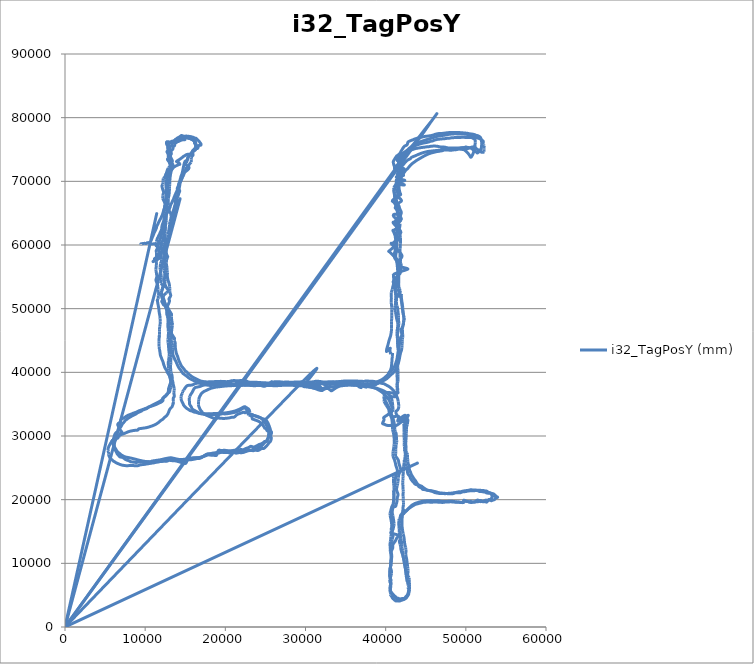
| Category | i32_TagPosY (mm) |
|---|---|
| 9508.0 | 60164 |
| 9508.0 | 60171 |
| 9514.0 | 60174 |
| 9505.0 | 60179 |
| 9490.0 | 60178 |
| 9482.0 | 60169 |
| 9490.0 | 60168 |
| 9494.0 | 60176 |
| 9494.0 | 60165 |
| 9496.0 | 60163 |
| 9495.0 | 60166 |
| 9503.0 | 60173 |
| 9493.0 | 60174 |
| 9495.0 | 60170 |
| 9493.0 | 60172 |
| 9486.0 | 60163 |
| 9476.0 | 60173 |
| 9476.0 | 60158 |
| 9491.0 | 60162 |
| 9473.0 | 60161 |
| 9464.0 | 60162 |
| 9460.0 | 60159 |
| 9462.0 | 60168 |
| 9476.0 | 60179 |
| 9481.0 | 60171 |
| 9497.0 | 60168 |
| 9513.0 | 60179 |
| 9499.0 | 60169 |
| 9489.0 | 60172 |
| 9486.0 | 60177 |
| 9472.0 | 60160 |
| 9494.0 | 60182 |
| 9512.0 | 60187 |
| 9535.0 | 60209 |
| 9546.0 | 60212 |
| 9554.0 | 60208 |
| 9574.0 | 60208 |
| 9587.0 | 60195 |
| 9631.0 | 60207 |
| 9661.0 | 60218 |
| 9683.0 | 60213 |
| 9715.0 | 60209 |
| 9768.0 | 60230 |
| 9831.0 | 60250 |
| 9904.0 | 60262 |
| 9976.0 | 60259 |
| 10040.0 | 60245 |
| 10109.0 | 60245 |
| 10147.0 | 60257 |
| 10198.0 | 60257 |
| 10268.0 | 60364 |
| 10333.0 | 60336 |
| 10413.0 | 60369 |
| 10482.0 | 60373 |
| 10530.0 | 60344 |
| 10536.0 | 60266 |
| 10630.0 | 60238 |
| 10724.0 | 60182 |
| 10878.0 | 60149 |
| 11151.0 | 60198 |
| 11250.0 | 60112 |
| 11346.0 | 59991 |
| 11384.0 | 59866 |
| 11542.0 | 59883 |
| 11562.0 | 59781 |
| 11581.0 | 59643 |
| 11616.0 | 59521 |
| 11771.0 | 59505 |
| 11882.0 | 59477 |
| 11995.0 | 59470 |
| 12104.0 | 59460 |
| 12104.0 | 59460 |
| 12074.0 | 59248 |
| 12100.0 | 59119 |
| 12120.0 | 59002 |
| 12131.0 | 58928 |
| 11970.0 | 58723 |
| 12002.0 | 58673 |
| 11736.0 | 58414 |
| 11424.0 | 58106 |
| 11167.0 | 57852 |
| 11167.0 | 57852 |
| 11175.0 | 57806 |
| 11420.0 | 57921 |
| 11351.0 | 57812 |
| 11278.0 | 57708 |
| 11243.0 | 57652 |
| 11230.0 | 57626 |
| 11421.0 | 57773 |
| 11262.0 | 57660 |
| 11044.0 | 57487 |
| 11003.0 | 57389 |
| 11380.0 | 57613 |
| 11691.0 | 57843 |
| 11884.0 | 58027 |
| 11826.0 | 58053 |
| 11690.0 | 58071 |
| 11690.0 | 58071 |
| 11604.0 | 58198 |
| 11740.0 | 58494 |
| 11740.0 | 58494 |
| 11804.0 | 58809 |
| 11723.0 | 58964 |
| 11736.0 | 59181 |
| 11694.0 | 59368 |
| 11606.0 | 59539 |
| 11516.0 | 59710 |
| 11443.0 | 59888 |
| 11438.0 | 60117 |
| 11432.0 | 60352 |
| 11403.0 | 60561 |
| 11483.0 | 60825 |
| 11502.0 | 60988 |
| 11605.0 | 61227 |
| 11702.0 | 61483 |
| 11794.0 | 61704 |
| 11865.0 | 61937 |
| 11963.0 | 62198 |
| 12052.0 | 62464 |
| 12073.0 | 62791 |
| 12118.0 | 63097 |
| 12205.0 | 63415 |
| 12299.0 | 63716 |
| 12409.0 | 64034 |
| 12519.0 | 64371 |
| 12655.0 | 64837 |
| 12777.0 | 65143 |
| 12903.0 | 65414 |
| 13025.0 | 65728 |
| 13134.0 | 66028 |
| 13162.0 | 66266 |
| 13291.0 | 66563 |
| 13403.0 | 66870 |
| 13524.0 | 67190 |
| 13621.0 | 67528 |
| 13727.0 | 67833 |
| 13825.0 | 68125 |
| 13942.0 | 68426 |
| 14024.0 | 68736 |
| 14089.0 | 69033 |
| 14127.0 | 69272 |
| 14184.0 | 69567 |
| 14263.0 | 69874 |
| 14338.0 | 70164 |
| 14404.0 | 70448 |
| 14475.0 | 70724 |
| 14541.0 | 70980 |
| 14608.0 | 71253 |
| 14657.0 | 71514 |
| 14701.0 | 71782 |
| 14748.0 | 72050 |
| 14787.0 | 72307 |
| 14827.0 | 72582 |
| 14889.0 | 72865 |
| 14981.0 | 73143 |
| 15165.0 | 73272 |
| 15287.0 | 73420 |
| 15397.0 | 73857 |
| 15467.0 | 74108 |
| 15467.0 | 74108 |
| 15570.0 | 74251 |
| 15795.0 | 74382 |
| 15864.0 | 74539 |
| 16017.0 | 74879 |
| 16103.0 | 74973 |
| 16190.0 | 75093 |
| 16296.0 | 75243 |
| 16396.0 | 75421 |
| 16249.0 | 75768 |
| 16241.0 | 75910 |
| 16253.0 | 76026 |
| 16205.0 | 76211 |
| 16274.0 | 76381 |
| 16202.0 | 76409 |
| 16051.0 | 76555 |
| 16200.0 | 76440 |
| 15964.0 | 76595 |
| 15752.0 | 76683 |
| 15506.0 | 76757 |
| 15274.0 | 76808 |
| 14870.0 | 77017 |
| 14537.0 | 77088 |
| 14537.0 | 77088 |
| 14425.0 | 76907 |
| 14273.0 | 76735 |
| 14156.0 | 76520 |
| 14028.0 | 76288 |
| 13880.0 | 76094 |
| 13880.0 | 76094 |
| 13701.0 | 75914 |
| 13667.0 | 75611 |
| 13500.0 | 75419 |
| 13471.0 | 75114 |
| 13346.0 | 74918 |
| 13220.0 | 74690 |
| 13272.0 | 74352 |
| 13184.0 | 74132 |
| 13148.0 | 73907 |
| 13274.0 | 73553 |
| 13400.0 | 73200 |
| 13343.0 | 72964 |
| 13470.0 | 72583 |
| 13525.0 | 72198 |
| 13379.0 | 71931 |
| 13256.0 | 71622 |
| 13194.0 | 71306 |
| 13149.0 | 70973 |
| 13111.0 | 70618 |
| 13083.0 | 70235 |
| 13066.0 | 69882 |
| 13064.0 | 69534 |
| 13044.0 | 69190 |
| 13037.0 | 68831 |
| 13016.0 | 68485 |
| 12999.0 | 68130 |
| 12954.0 | 67718 |
| 12875.0 | 67338 |
| 12877.0 | 66920 |
| 12900.0 | 66600 |
| 12877.0 | 66246 |
| 12839.0 | 65861 |
| 12770.0 | 65519 |
| 12770.0 | 65519 |
| 12745.0 | 65134 |
| 12623.0 | 64737 |
| 12576.0 | 64387 |
| 12511.0 | 63995 |
| 12466.0 | 63589 |
| 12531.0 | 63283 |
| 12546.0 | 62946 |
| 12503.0 | 62553 |
| 12411.0 | 62161 |
| 12345.0 | 61774 |
| 12321.0 | 61446 |
| 12247.0 | 61073 |
| 12202.0 | 60745 |
| 11947.0 | 60242 |
| 12045.0 | 59985 |
| 11850.0 | 59517 |
| 11719.0 | 59082 |
| 11856.0 | 58866 |
| 11894.0 | 58607 |
| 11972.0 | 58361 |
| 12019.0 | 58077 |
| 12037.0 | 57774 |
| 12040.0 | 57475 |
| 11916.0 | 57095 |
| 11890.0 | 56785 |
| 11858.0 | 56470 |
| 11863.0 | 56167 |
| 11961.0 | 55870 |
| 11957.0 | 55553 |
| 11977.0 | 55258 |
| 12028.0 | 54943 |
| 12007.0 | 54633 |
| 11969.0 | 54319 |
| 11945.0 | 53971 |
| 12259.0 | 53646 |
| 12168.0 | 53319 |
| 12140.0 | 53069 |
| 12019.0 | 52833 |
| 12006.0 | 52492 |
| 11930.0 | 52243 |
| 12089.0 | 51962 |
| 12183.0 | 51439 |
| 12067.0 | 51146 |
| 12185.0 | 50856 |
| 12306.0 | 50576 |
| 12592.0 | 50410 |
| 12670.0 | 49812 |
| 12670.0 | 49812 |
| 12783.0 | 49265 |
| 12826.0 | 48723 |
| 12844.0 | 48245 |
| 12852.0 | 47804 |
| 12883.0 | 47203 |
| 12888.0 | 46802 |
| 12896.0 | 46399 |
| 12901.0 | 46036 |
| 12877.0 | 45701 |
| 12864.0 | 45385 |
| 12843.0 | 45083 |
| 12824.0 | 45074 |
| 12826.0 | 45123 |
| 12863.0 | 44675 |
| 12898.0 | 44330 |
| 12925.0 | 43915 |
| 12946.0 | 43534 |
| 12980.0 | 43179 |
| 13015.0 | 42854 |
| 12978.0 | 42462 |
| 12949.0 | 42096 |
| 12898.0 | 41787 |
| 12888.0 | 41458 |
| 12889.0 | 41147 |
| 12910.0 | 40853 |
| 12913.0 | 40591 |
| 12924.0 | 40295 |
| 12937.0 | 39994 |
| 13001.0 | 39676 |
| 13075.0 | 39362 |
| 13143.0 | 39016 |
| 13195.0 | 38647 |
| 13159.0 | 38305 |
| 13159.0 | 38305 |
| 13045.0 | 37949 |
| 12995.0 | 37704 |
| 12922.0 | 37435 |
| 12896.0 | 37115 |
| 12873.0 | 36778 |
| 12711.0 | 36594 |
| 12560.0 | 36369 |
| 12377.0 | 36152 |
| 12209.0 | 35955 |
| 12088.0 | 35675 |
| 11882.0 | 35489 |
| 11649.0 | 35324 |
| 11398.0 | 35174 |
| 11171.0 | 35014 |
| 10931.0 | 34867 |
| 10723.0 | 34721 |
| 10485.0 | 34572 |
| 10344.0 | 34439 |
| 10178.0 | 34296 |
| 9895.0 | 34166 |
| 9647.0 | 34038 |
| 9512.0 | 33901 |
| 9233.0 | 33751 |
| 9020.0 | 33619 |
| 8870.0 | 33476 |
| 8605.0 | 33312 |
| 8358.0 | 33151 |
| 8127.0 | 32979 |
| 7923.0 | 32823 |
| 7729.0 | 32635 |
| 7547.0 | 32469 |
| 7437.0 | 32297 |
| 7319.0 | 32118 |
| 7174.0 | 31912 |
| 7061.0 | 31677 |
| 6965.0 | 31435 |
| 6751.0 | 31197 |
| 7107.0 | 30586 |
| 6962.0 | 30468 |
| 6821.0 | 30313 |
| 6698.0 | 30124 |
| 6727.0 | 29749 |
| 6519.0 | 29649 |
| 6398.0 | 29555 |
| 6336.0 | 29438 |
| 6196.0 | 29210 |
| 6154.0 | 28947 |
| 6139.0 | 28716 |
| 6135.0 | 28442 |
| 6131.0 | 28271 |
| 6169.0 | 28066 |
| 6245.0 | 27843 |
| 6340.0 | 27628 |
| 6436.0 | 27386 |
| 6522.0 | 27162 |
| 6640.0 | 27019 |
| 6744.0 | 26845 |
| 6856.0 | 26715 |
| 7247.0 | 26621 |
| 7247.0 | 26621 |
| 7476.0 | 26359 |
| 7742.0 | 26208 |
| 7999.0 | 26090 |
| 8196.0 | 25954 |
| 8196.0 | 25954 |
| 8503.0 | 25909 |
| 8877.0 | 25836 |
| 8877.0 | 25836 |
| 9218.0 | 25911 |
| 9616.0 | 25923 |
| 9989.0 | 25932 |
| 10329.0 | 25946 |
| 10675.0 | 25972 |
| 10869.0 | 26070 |
| 11177.0 | 26124 |
| 11474.0 | 26183 |
| 11779.0 | 26239 |
| 12067.0 | 26313 |
| 12369.0 | 26410 |
| 12663.0 | 26477 |
| 12977.0 | 26555 |
| 13280.0 | 26568 |
| 13725.0 | 26447 |
| 14127.0 | 26337 |
| 14497.0 | 26305 |
| 14851.0 | 26338 |
| 15196.0 | 26362 |
| 15527.0 | 26388 |
| 15833.0 | 26444 |
| 16140.0 | 26515 |
| 16426.0 | 26572 |
| 16718.0 | 26609 |
| 17025.0 | 26639 |
| 17438.0 | 26976 |
| 17804.0 | 27203 |
| 17974.0 | 27197 |
| 18179.0 | 27201 |
| 18408.0 | 27245 |
| 18666.0 | 27270 |
| 18921.0 | 27300 |
| 19154.0 | 27321 |
| 19480.0 | 27425 |
| 19761.0 | 27420 |
| 20054.0 | 27416 |
| 20329.0 | 27395 |
| 20553.0 | 27340 |
| 20816.0 | 27397 |
| 21137.0 | 27392 |
| 21341.0 | 27303 |
| 21705.0 | 27394 |
| 21978.0 | 27368 |
| 22201.0 | 27425 |
| 22558.0 | 27593 |
| 22872.0 | 27806 |
| 23190.0 | 27744 |
| 23535.0 | 27701 |
| 23818.0 | 27925 |
| 24046.0 | 28121 |
| 24286.0 | 28272 |
| 24514.0 | 28447 |
| 24718.0 | 28700 |
| 24906.0 | 28963 |
| 25065.0 | 29135 |
| 25141.0 | 29117 |
| 25190.0 | 29212 |
| 25262.0 | 29339 |
| 25422.0 | 29766 |
| 25385.0 | 29716 |
| 25392.0 | 29854 |
| 25379.0 | 30032 |
| 25468.0 | 30540 |
| 25509.0 | 30976 |
| 25352.0 | 30856 |
| 25203.0 | 30833 |
| 25074.0 | 31168 |
| 24924.0 | 31214 |
| 24762.0 | 31559 |
| 24594.0 | 31828 |
| 24411.0 | 32044 |
| 24237.0 | 32244 |
| 24017.0 | 32379 |
| 23809.0 | 32470 |
| 23593.0 | 32581 |
| 23365.0 | 32678 |
| 23336.0 | 32923 |
| 23236.0 | 33130 |
| 23121.0 | 33287 |
| 23008.0 | 33486 |
| 22855.0 | 33586 |
| 22685.0 | 33747 |
| 22452.0 | 33651 |
| 22272.0 | 33735 |
| 21808.0 | 33532 |
| 21440.0 | 33344 |
| 21111.0 | 32979 |
| 20784.0 | 32931 |
| 20468.0 | 32840 |
| 20131.0 | 32789 |
| 19776.0 | 32753 |
| 19474.0 | 32790 |
| 19234.0 | 32809 |
| 18920.0 | 32835 |
| 18588.0 | 32785 |
| 18374.0 | 32883 |
| 18145.0 | 32995 |
| 17898.0 | 33128 |
| 17673.0 | 33254 |
| 17520.0 | 33370 |
| 17327.0 | 33494 |
| 17152.0 | 33612 |
| 17086.0 | 33818 |
| 16941.0 | 34012 |
| 16834.0 | 34236 |
| 16757.0 | 34473 |
| 16679.0 | 34713 |
| 16641.0 | 34954 |
| 16660.0 | 35197 |
| 16666.0 | 35443 |
| 16687.0 | 35698 |
| 16728.0 | 35964 |
| 16806.0 | 36206 |
| 16913.0 | 36439 |
| 16986.0 | 36630 |
| 17139.0 | 36808 |
| 17311.0 | 36970 |
| 17486.0 | 37082 |
| 17663.0 | 37183 |
| 17906.0 | 37329 |
| 18129.0 | 37456 |
| 18392.0 | 37554 |
| 18661.0 | 37637 |
| 18915.0 | 37701 |
| 19184.0 | 37724 |
| 19487.0 | 37778 |
| 19756.0 | 37814 |
| 20017.0 | 37848 |
| 20335.0 | 37877 |
| 20673.0 | 37879 |
| 20934.0 | 37946 |
| 21239.0 | 37989 |
| 21533.0 | 37962 |
| 21842.0 | 37929 |
| 22172.0 | 37992 |
| 22172.0 | 37992 |
| 22580.0 | 38031 |
| 22580.0 | 38031 |
| 23079.0 | 38006 |
| 23079.0 | 38006 |
| 23651.0 | 38012 |
| 24153.0 | 38001 |
| 24630.0 | 37991 |
| 25077.0 | 37954 |
| 25490.0 | 37928 |
| 25490.0 | 37928 |
| 25490.0 | 37928 |
| 25490.0 | 37928 |
| 26157.0 | 37905 |
| 26765.0 | 37921 |
| 27313.0 | 37975 |
| 27780.0 | 37963 |
| 28242.0 | 37959 |
| 28682.0 | 37938 |
| 29064.0 | 37874 |
| 29382.0 | 37903 |
| 29710.0 | 37907 |
| 30048.0 | 37909 |
| 30361.0 | 37907 |
| 30468.0 | 37689 |
| 30836.0 | 37762 |
| 30911.0 | 37562 |
| 31314.0 | 37700 |
| 31735.0 | 37278 |
| 32175.0 | 37247 |
| 32477.0 | 37428 |
| 32849.0 | 37432 |
| 33197.0 | 37105 |
| 33361.0 | 37182 |
| 33602.0 | 37389 |
| 33841.0 | 37583 |
| 34059.0 | 37734 |
| 34270.0 | 37840 |
| 34531.0 | 37888 |
| 34791.0 | 37937 |
| 35093.0 | 37976 |
| 35388.0 | 37998 |
| 35585.0 | 38027 |
| 35585.0 | 38027 |
| 35766.0 | 37960 |
| 35959.0 | 37982 |
| 36164.0 | 37977 |
| 36333.0 | 37976 |
| 36943.0 | 37605 |
| 36671.0 | 37715 |
| 36697.0 | 37782 |
| 36691.0 | 37839 |
| 36739.0 | 37885 |
| 36856.0 | 37919 |
| 37553.0 | 37678 |
| 37588.0 | 37752 |
| 37755.0 | 37907 |
| 37940.0 | 37916 |
| 38135.0 | 37911 |
| 38337.0 | 37932 |
| 38474.0 | 37961 |
| 38612.0 | 37995 |
| 38896.0 | 38172 |
| 39122.0 | 38340 |
| 39317.0 | 38479 |
| 39560.0 | 38649 |
| 39766.0 | 38853 |
| 39944.0 | 39045 |
| 40063.0 | 39239 |
| 40176.0 | 39415 |
| 40290.0 | 39625 |
| 40375.0 | 39855 |
| 40477.0 | 40056 |
| 40557.0 | 40228 |
| 40622.0 | 40423 |
| 40681.0 | 40654 |
| 40724.0 | 40952 |
| 40746.0 | 41245 |
| 40765.0 | 41525 |
| 40785.0 | 41815 |
| 40802.0 | 42114 |
| 40814.0 | 42414 |
| 40858.0 | 42728 |
| 40856.0 | 43036 |
| 40644.0 | 42851 |
| 40580.0 | 43059 |
| 40540.0 | 43348 |
| 40540.0 | 43348 |
| 40549.0 | 43752 |
| 40549.0 | 43752 |
| 40549.0 | 43752 |
| 40549.0 | 43752 |
| 40086.0 | 43294 |
| 40280.0 | 44297 |
| 40445.0 | 45103 |
| 40613.0 | 45743 |
| 40702.0 | 46349 |
| 40736.0 | 46919 |
| 40730.0 | 47492 |
| 40731.0 | 48019 |
| 40756.0 | 48509 |
| 40775.0 | 48980 |
| 40767.0 | 49431 |
| 40776.0 | 49853 |
| 40760.0 | 50229 |
| 40723.0 | 50619 |
| 40697.0 | 51008 |
| 40701.0 | 51364 |
| 40717.0 | 51686 |
| 40702.0 | 52001 |
| 40705.0 | 52300 |
| 40699.0 | 52583 |
| 40826.0 | 53008 |
| 40886.0 | 53423 |
| 40986.0 | 53835 |
| 41001.0 | 54243 |
| 41025.0 | 54638 |
| 40989.0 | 55021 |
| 40989.0 | 55021 |
| 41030.0 | 55411 |
| 42012.0 | 55887 |
| 42778.0 | 56221 |
| 42127.0 | 56492 |
| 41628.0 | 56761 |
| 41628.0 | 56761 |
| 41510.0 | 57273 |
| 41510.0 | 57273 |
| 41510.0 | 57273 |
| 41133.0 | 57951 |
| 41133.0 | 57951 |
| 41034.0 | 58472 |
| 41190.0 | 59061 |
| 41148.0 | 59703 |
| 41406.0 | 60213 |
| 41406.0 | 60213 |
| 41379.0 | 60788 |
| 41379.0 | 60788 |
| 41418.0 | 61367 |
| 41451.0 | 61870 |
| 41422.0 | 62339 |
| 41364.0 | 62810 |
| 41270.0 | 63260 |
| 41218.0 | 63663 |
| 41505.0 | 63722 |
| 41746.0 | 63831 |
| 41088.0 | 64351 |
| 41003.0 | 64795 |
| 41406.0 | 64842 |
| 41406.0 | 64842 |
| 41494.0 | 65378 |
| 41202.0 | 65815 |
| 41296.0 | 66273 |
| 41102.0 | 66684 |
| 41249.0 | 67078 |
| 41374.0 | 67443 |
| 41464.0 | 67796 |
| 41528.0 | 68149 |
| 41434.0 | 68472 |
| 41572.0 | 68782 |
| 41612.0 | 69074 |
| 41399.0 | 69360 |
| 41407.0 | 69677 |
| 41461.0 | 69983 |
| 41551.0 | 70268 |
| 41697.0 | 70540 |
| 41553.0 | 70802 |
| 41828.0 | 71063 |
| 41726.0 | 71311 |
| 41724.0 | 71562 |
| 41788.0 | 71808 |
| 41898.0 | 72047 |
| 41993.0 | 72292 |
| 42087.0 | 72521 |
| 42257.0 | 72730 |
| 42417.0 | 72963 |
| 42590.0 | 73182 |
| 42806.0 | 73386 |
| 43051.0 | 73534 |
| 43224.0 | 73762 |
| 43476.0 | 73906 |
| 43739.0 | 74034 |
| 43993.0 | 74184 |
| 44251.0 | 74311 |
| 44511.0 | 74440 |
| 44778.0 | 74541 |
| 45002.0 | 74607 |
| 45210.0 | 74673 |
| 45469.0 | 74723 |
| 45735.0 | 74757 |
| 46036.0 | 74806 |
| 46339.0 | 74839 |
| 46616.0 | 74876 |
| 46792.0 | 74874 |
| 47201.0 | 75221 |
| 47281.0 | 75128 |
| 47564.0 | 75045 |
| 47846.0 | 74983 |
| 48103.0 | 74906 |
| 48392.0 | 74956 |
| 48693.0 | 74949 |
| 48693.0 | 74949 |
| 49154.0 | 75071 |
| 49154.0 | 75071 |
| 49154.0 | 75071 |
| 49154.0 | 75071 |
| 49154.0 | 75071 |
| 49154.0 | 75071 |
| 49154.0 | 75071 |
| 49154.0 | 75071 |
| 49154.0 | 75071 |
| 49154.0 | 75071 |
| 49792.0 | 74973 |
| 49792.0 | 74973 |
| 49792.0 | 74973 |
| 49792.0 | 74973 |
| 49792.0 | 74973 |
| 49792.0 | 74973 |
| 49792.0 | 74973 |
| 49792.0 | 74973 |
| 49792.0 | 74973 |
| 50193.0 | 74517 |
| 50460.0 | 74092 |
| 50637.0 | 73768 |
| 50862.0 | 74226 |
| 51076.0 | 75044 |
| 51076.0 | 75044 |
| 51076.0 | 75044 |
| 51142.0 | 75598 |
| 51171.0 | 76118 |
| 51175.0 | 76482 |
| 51104.0 | 76790 |
| 50991.0 | 76984 |
| 50771.0 | 77161 |
| 50559.0 | 77264 |
| 50295.0 | 77345 |
| 50004.0 | 77388 |
| 49750.0 | 77421 |
| 49466.0 | 77448 |
| 49203.0 | 77444 |
| 48929.0 | 77447 |
| 48651.0 | 77466 |
| 48337.0 | 77434 |
| 48002.0 | 77400 |
| 47683.0 | 77337 |
| 47371.0 | 77252 |
| 47074.0 | 77205 |
| 46760.0 | 77152 |
| 46459.0 | 77079 |
| 46178.0 | 76971 |
| 45868.0 | 76857 |
| 45587.0 | 76734 |
| 45275.0 | 76606 |
| 44978.0 | 76498 |
| 44708.0 | 76373 |
| 44438.0 | 76258 |
| 44182.0 | 76108 |
| 43899.0 | 75950 |
| 43629.0 | 75783 |
| 43373.0 | 75610 |
| 43164.0 | 75394 |
| 42933.0 | 75182 |
| 42776.0 | 74989 |
| 42573.0 | 74782 |
| 42312.0 | 74552 |
| 42064.0 | 74295 |
| 41851.0 | 74060 |
| 41745.0 | 73818 |
| 41720.0 | 73525 |
| 41569.0 | 73242 |
| 41569.0 | 73242 |
| 41610.0 | 72889 |
| 41538.0 | 72543 |
| 42315.0 | 71946 |
| 42002.0 | 71689 |
| 41753.0 | 71416 |
| 41429.0 | 71119 |
| 41578.0 | 70830 |
| 41645.0 | 70481 |
| 41325.0 | 70214 |
| 41387.0 | 69915 |
| 41467.0 | 69605 |
| 41345.0 | 69313 |
| 41237.0 | 69046 |
| 41112.0 | 68768 |
| 41076.0 | 68454 |
| 41100.0 | 68125 |
| 41112.0 | 67761 |
| 41135.0 | 67382 |
| 41179.0 | 67013 |
| 41360.0 | 66520 |
| 41325.0 | 66202 |
| 41350.0 | 65887 |
| 41358.0 | 65544 |
| 41512.0 | 65133 |
| 41582.0 | 64807 |
| 41653.0 | 64459 |
| 41305.0 | 64121 |
| 41432.0 | 63782 |
| 41501.0 | 63417 |
| 41485.0 | 63053 |
| 41499.0 | 62704 |
| 41499.0 | 62704 |
| 40941.0 | 62268 |
| 40941.0 | 62268 |
| 40941.0 | 62268 |
| 40941.0 | 62268 |
| 40941.0 | 62268 |
| 40941.0 | 62268 |
| 41174.0 | 61478 |
| 41174.0 | 61478 |
| 41174.0 | 61478 |
| 41174.0 | 61478 |
| 41174.0 | 61478 |
| 41174.0 | 61478 |
| 41305.0 | 60344 |
| 41425.0 | 59370 |
| 41290.0 | 58668 |
| 41244.0 | 58052 |
| 41365.0 | 57408 |
| 41444.0 | 56831 |
| 41474.0 | 56303 |
| 41517.0 | 55833 |
| 41567.0 | 55405 |
| 41071.0 | 54482 |
| 40928.0 | 54204 |
| 41055.0 | 53960 |
| 41170.0 | 53642 |
| 41218.0 | 53284 |
| 41207.0 | 52875 |
| 41242.0 | 52527 |
| 41298.0 | 52212 |
| 41344.0 | 51882 |
| 41356.0 | 51514 |
| 41368.0 | 51145 |
| 41340.0 | 50748 |
| 41411.0 | 50457 |
| 41472.0 | 50169 |
| 41509.0 | 49854 |
| 41533.0 | 49532 |
| 41567.0 | 49231 |
| 41604.0 | 48912 |
| 41606.0 | 48580 |
| 41582.0 | 48213 |
| 41669.0 | 47730 |
| 41615.0 | 47411 |
| 41578.0 | 47051 |
| 41558.0 | 46730 |
| 41534.0 | 46418 |
| 41486.0 | 46033 |
| 41475.0 | 45726 |
| 41461.0 | 45358 |
| 41465.0 | 45016 |
| 41469.0 | 44666 |
| 41510.0 | 44302 |
| 41530.0 | 43964 |
| 41578.0 | 43645 |
| 41591.0 | 43330 |
| 41576.0 | 42970 |
| 41618.0 | 42608 |
| 41636.0 | 42322 |
| 41512.0 | 42099 |
| 41440.0 | 41889 |
| 41356.0 | 41477 |
| 41323.0 | 41073 |
| 41356.0 | 40682 |
| 41384.0 | 40320 |
| 41416.0 | 39948 |
| 41415.0 | 39614 |
| 41429.0 | 39270 |
| 41440.0 | 38919 |
| 41454.0 | 38572 |
| 41457.0 | 38237 |
| 41434.0 | 37938 |
| 41489.0 | 37540 |
| 41513.0 | 37150 |
| 41523.0 | 36773 |
| 41299.0 | 36617 |
| 40765.0 | 36772 |
| 40277.0 | 36846 |
| 39957.0 | 36784 |
| 39872.0 | 36505 |
| 39799.0 | 36235 |
| 39812.0 | 35901 |
| 39812.0 | 35901 |
| 40070.0 | 35276 |
| 40315.0 | 34696 |
| 40581.0 | 34109 |
| 40684.0 | 33517 |
| 40840.0 | 33037 |
| 40955.0 | 32609 |
| 41032.0 | 32195 |
| 41091.0 | 31776 |
| 41121.0 | 31365 |
| 41142.0 | 30961 |
| 41215.0 | 30655 |
| 41305.0 | 30396 |
| 41327.0 | 30051 |
| 41348.0 | 29714 |
| 41368.0 | 29350 |
| 41370.0 | 29021 |
| 41312.0 | 28661 |
| 41278.0 | 28285 |
| 41267.0 | 27915 |
| 41248.0 | 27565 |
| 41252.0 | 27217 |
| 41212.0 | 26863 |
| 41569.0 | 26234 |
| 41648.0 | 25720 |
| 41779.0 | 25190 |
| 41912.0 | 24684 |
| 41888.0 | 24420 |
| 41739.0 | 24223 |
| 41652.0 | 23979 |
| 41589.0 | 23710 |
| 41583.0 | 23465 |
| 41585.0 | 23272 |
| 41527.0 | 22839 |
| 41515.0 | 22523 |
| 41429.0 | 22231 |
| 41415.0 | 22005 |
| 41354.0 | 21676 |
| 41417.0 | 21279 |
| 41489.0 | 21060 |
| 41549.0 | 20782 |
| 41465.0 | 20398 |
| 41419.0 | 20030 |
| 41396.0 | 19623 |
| 41313.0 | 19271 |
| 41239.0 | 18949 |
| 40965.0 | 18831 |
| 40875.0 | 18546 |
| 40826.0 | 18236 |
| 40825.0 | 17887 |
| 40894.0 | 17478 |
| 40949.0 | 17062 |
| 41007.0 | 16642 |
| 41048.0 | 16246 |
| 41024.0 | 15892 |
| 40961.0 | 15583 |
| 40889.0 | 15279 |
| 40826.0 | 15023 |
| 40794.0 | 14779 |
| 40927.0 | 14358 |
| 40798.0 | 13757 |
| 40780.0 | 13374 |
| 40668.0 | 12932 |
| 40604.0 | 12562 |
| 40560.0 | 12190 |
| 40583.0 | 11887 |
| 40667.0 | 11653 |
| 40676.0 | 11358 |
| 40704.0 | 11098 |
| 40713.0 | 10801 |
| 40681.0 | 10505 |
| 40655.0 | 10252 |
| 40633.0 | 9997 |
| 40623.0 | 9774 |
| 40602.0 | 9534 |
| 40561.0 | 9302 |
| 40544.0 | 9087 |
| 40525.0 | 8853 |
| 40506.0 | 8614 |
| 40495.0 | 8383 |
| 40509.0 | 8157 |
| 40516.0 | 7956 |
| 40546.0 | 7774 |
| 40574.0 | 7615 |
| 40603.0 | 7464 |
| 40528.0 | 7240 |
| 40542.0 | 7087 |
| 40595.0 | 6900 |
| 40612.0 | 6703 |
| 40602.0 | 6510 |
| 40570.0 | 6304 |
| 40588.0 | 6057 |
| 40605.0 | 5854 |
| 40588.0 | 5702 |
| 40673.0 | 5505 |
| 40809.0 | 5283 |
| 40922.0 | 5132 |
| 40999.0 | 5011 |
| 41059.0 | 4921 |
| 41216.0 | 4758 |
| 41411.0 | 4549 |
| 41477.0 | 4502 |
| 41570.0 | 4507 |
| 41761.0 | 4406 |
| 41895.0 | 4425 |
| 42000.0 | 4461 |
| 42158.0 | 4491 |
| 42239.0 | 4489 |
| 42266.0 | 4469 |
| 42417.0 | 4603 |
| 42502.0 | 4737 |
| 42597.0 | 4860 |
| 42697.0 | 5008 |
| 42766.0 | 5190 |
| 42807.0 | 5392 |
| 42845.0 | 5591 |
| 42869.0 | 5801 |
| 42833.0 | 5969 |
| 42824.0 | 6175 |
| 42843.0 | 6390 |
| 42817.0 | 6585 |
| 42762.0 | 6805 |
| 42728.0 | 7075 |
| 42652.0 | 7283 |
| 42625.0 | 7555 |
| 42588.0 | 7823 |
| 42555.0 | 8086 |
| 42544.0 | 8360 |
| 42502.0 | 8623 |
| 42483.0 | 8901 |
| 42461.0 | 9171 |
| 42415.0 | 9415 |
| 42391.0 | 9684 |
| 42340.0 | 9962 |
| 42310.0 | 10277 |
| 42259.0 | 10570 |
| 42219.0 | 10852 |
| 42166.0 | 11121 |
| 42109.0 | 11401 |
| 42021.0 | 11659 |
| 41963.0 | 11888 |
| 41917.0 | 12160 |
| 41859.0 | 12432 |
| 41861.0 | 12686 |
| 41795.0 | 13012 |
| 41710.0 | 13455 |
| 41778.0 | 13662 |
| 41828.0 | 13867 |
| 41803.0 | 14136 |
| 41773.0 | 14383 |
| 41750.0 | 14561 |
| 41711.0 | 14797 |
| 41707.0 | 15089 |
| 41677.0 | 15483 |
| 41649.0 | 15864 |
| 41646.0 | 16190 |
| 41630.0 | 16506 |
| 41636.0 | 16737 |
| 41682.0 | 16949 |
| 41759.0 | 17081 |
| 41824.0 | 17273 |
| 41853.0 | 17522 |
| 41966.0 | 17702 |
| 42068.0 | 17887 |
| 42201.0 | 18064 |
| 42328.0 | 18276 |
| 42567.0 | 18254 |
| 42739.0 | 18477 |
| 42916.0 | 18715 |
| 43105.0 | 18928 |
| 43299.0 | 19153 |
| 43488.0 | 19283 |
| 43693.0 | 19422 |
| 43924.0 | 19518 |
| 44153.0 | 19609 |
| 44396.0 | 19694 |
| 44628.0 | 19756 |
| 44874.0 | 19791 |
| 45125.0 | 19826 |
| 45389.0 | 19835 |
| 45647.0 | 19856 |
| 45902.0 | 19836 |
| 46146.0 | 19823 |
| 46368.0 | 19845 |
| 46609.0 | 19847 |
| 46859.0 | 19744 |
| 47124.0 | 19704 |
| 47377.0 | 19713 |
| 47623.0 | 19710 |
| 47858.0 | 19746 |
| 48075.0 | 19747 |
| 48333.0 | 19739 |
| 48569.0 | 19704 |
| 48815.0 | 19663 |
| 49050.0 | 19616 |
| 49269.0 | 19565 |
| 49502.0 | 19536 |
| 49719.0 | 19558 |
| 49842.0 | 19754 |
| 50137.0 | 19713 |
| 50291.0 | 19690 |
| 50500.0 | 19666 |
| 50624.0 | 19739 |
| 50815.0 | 19645 |
| 51205.0 | 19650 |
| 51447.0 | 19666 |
| 51563.0 | 19703 |
| 51817.0 | 19889 |
| 51786.0 | 19693 |
| 51980.0 | 19717 |
| 52186.0 | 19655 |
| 52414.0 | 19698 |
| 52601.0 | 19619 |
| 52865.0 | 20002 |
| 52989.0 | 19945 |
| 53089.0 | 19941 |
| 53163.0 | 19892 |
| 53188.0 | 19834 |
| 53385.0 | 19939 |
| 53472.0 | 19964 |
| 53522.0 | 19979 |
| 53615.0 | 20076 |
| 53678.0 | 20167 |
| 53686.0 | 20255 |
| 53964.0 | 20366 |
| 53844.0 | 20481 |
| 53661.0 | 20579 |
| 53670.0 | 20673 |
| 53614.0 | 20747 |
| 53538.0 | 20821 |
| 53462.0 | 20906 |
| 53338.0 | 20949 |
| 53117.0 | 21008 |
| 52967.0 | 21022 |
| 52772.0 | 21015 |
| 52600.0 | 21056 |
| 52484.0 | 21125 |
| 52369.0 | 21206 |
| 52199.0 | 21218 |
| 51985.0 | 21268 |
| 51739.0 | 21278 |
| 51607.0 | 21334 |
| 51532.0 | 21418 |
| 51375.0 | 21425 |
| 51205.0 | 21424 |
| 50181.0 | 21361 |
| 50125.0 | 21324 |
| 50038.0 | 21278 |
| 49916.0 | 21262 |
| 49775.0 | 21249 |
| 49640.0 | 21230 |
| 49484.0 | 21179 |
| 49313.0 | 21084 |
| 49151.0 | 21087 |
| 48998.0 | 21095 |
| 48847.0 | 21104 |
| 48672.0 | 21066 |
| 48468.0 | 20971 |
| 48287.0 | 20911 |
| 48118.0 | 20920 |
| 47930.0 | 20915 |
| 47754.0 | 20940 |
| 47581.0 | 20953 |
| 47394.0 | 20944 |
| 47199.0 | 20959 |
| 47036.0 | 20972 |
| 46866.0 | 20985 |
| 46704.0 | 20976 |
| 46494.0 | 21025 |
| 46339.0 | 21055 |
| 46197.0 | 21091 |
| 46068.0 | 21150 |
| 45914.0 | 21254 |
| 45756.0 | 21323 |
| 45603.0 | 21386 |
| 45445.0 | 21439 |
| 45271.0 | 21466 |
| 45105.0 | 21497 |
| 44941.0 | 21551 |
| 44778.0 | 21604 |
| 44619.0 | 21619 |
| 44494.0 | 21794 |
| 44324.0 | 21913 |
| 44139.0 | 22056 |
| 44002.0 | 22283 |
| 43783.0 | 22372 |
| 43621.0 | 22512 |
| 43500.0 | 22704 |
| 43348.0 | 22889 |
| 43228.0 | 23100 |
| 43111.0 | 23316 |
| 43037.0 | 23576 |
| 42952.0 | 23784 |
| 42827.0 | 23928 |
| 42746.0 | 24156 |
| 42710.0 | 24431 |
| 42679.0 | 24692 |
| 42581.0 | 24959 |
| 42552.0 | 25175 |
| 42542.0 | 25435 |
| 42514.0 | 25663 |
| 42493.0 | 25863 |
| 42487.0 | 26118 |
| 42483.0 | 26374 |
| 42493.0 | 26607 |
| 42494.0 | 26844 |
| 42494.0 | 27087 |
| 42500.0 | 27400 |
| 42371.0 | 27587 |
| 42358.0 | 27838 |
| 42368.0 | 28124 |
| 42317.0 | 28376 |
| 42333.0 | 28691 |
| 42323.0 | 29007 |
| 42315.0 | 29274 |
| 42312.0 | 29538 |
| 42302.0 | 29796 |
| 42296.0 | 30038 |
| 42293.0 | 30289 |
| 42285.0 | 30531 |
| 42286.0 | 30739 |
| 42294.0 | 30976 |
| 42304.0 | 31233 |
| 42297.0 | 31494 |
| 42291.0 | 31735 |
| 42236.0 | 31960 |
| 42355.0 | 32323 |
| 42509.0 | 32715 |
| 41862.0 | 32110 |
| 41290.0 | 31627 |
| 40864.0 | 31647 |
| 40442.0 | 31640 |
| 40092.0 | 31693 |
| 39849.0 | 31833 |
| 39607.0 | 31979 |
| 39810.0 | 32573 |
| 39753.0 | 32891 |
| 40225.0 | 33309 |
| 40551.0 | 33625 |
| 40765.0 | 33893 |
| 40903.0 | 34158 |
| 40878.0 | 34828 |
| 40826.0 | 35380 |
| 40767.0 | 35739 |
| 40665.0 | 36042 |
| 40571.0 | 36269 |
| 40415.0 | 36478 |
| 40224.0 | 36708 |
| 40007.0 | 36907 |
| 39786.0 | 37057 |
| 39556.0 | 37190 |
| 39309.0 | 37307 |
| 39064.0 | 37424 |
| 38822.0 | 37527 |
| 38561.0 | 37564 |
| 38293.0 | 37637 |
| 38030.0 | 37699 |
| 37713.0 | 37786 |
| 37416.0 | 37847 |
| 37100.0 | 37909 |
| 36759.0 | 38009 |
| 36496.0 | 38016 |
| 36193.0 | 38044 |
| 35865.0 | 38076 |
| 35506.0 | 38119 |
| 35506.0 | 38119 |
| 35105.0 | 38140 |
| 34691.0 | 38151 |
| 34691.0 | 38151 |
| 34284.0 | 38232 |
| 34284.0 | 38232 |
| 34284.0 | 38232 |
| 33681.0 | 38204 |
| 33681.0 | 38204 |
| 33681.0 | 38204 |
| 32990.0 | 38235 |
| 32516.0 | 38132 |
| 31997.0 | 38212 |
| 31523.0 | 38252 |
| 31909.0 | 37347 |
| 31426.0 | 37437 |
| 31426.0 | 37437 |
| 31426.0 | 37437 |
| 31426.0 | 37437 |
| 30581.0 | 37646 |
| 30581.0 | 37646 |
| 29769.0 | 37760 |
| 29085.0 | 37858 |
| 0.0 | 0 |
| 0.0 | 0 |
| 0.0 | 0 |
| 0.0 | 0 |
| 0.0 | 0 |
| 0.0 | 0 |
| 0.0 | 0 |
| 0.0 | 0 |
| 0.0 | 0 |
| 0.0 | 0 |
| 0.0 | 0 |
| 0.0 | 0 |
| 0.0 | 0 |
| 0.0 | 0 |
| 0.0 | 0 |
| 0.0 | 0 |
| 0.0 | 0 |
| 0.0 | 0 |
| 0.0 | 0 |
| 0.0 | 0 |
| 0.0 | 0 |
| 0.0 | 0 |
| 0.0 | 0 |
| 0.0 | 0 |
| 0.0 | 0 |
| 0.0 | 0 |
| 0.0 | 0 |
| 0.0 | 0 |
| 0.0 | 0 |
| 0.0 | 0 |
| 0.0 | 0 |
| 0.0 | 0 |
| 0.0 | 0 |
| 0.0 | 0 |
| 0.0 | 0 |
| 0.0 | 0 |
| 0.0 | 0 |
| 0.0 | 0 |
| 0.0 | 0 |
| 0.0 | 0 |
| 0.0 | 0 |
| 0.0 | 0 |
| 0.0 | 0 |
| 0.0 | 0 |
| 0.0 | 0 |
| 0.0 | 0 |
| 0.0 | 0 |
| 0.0 | 0 |
| 0.0 | 0 |
| 0.0 | 0 |
| 0.0 | 0 |
| 0.0 | 0 |
| 0.0 | 0 |
| 0.0 | 0 |
| 0.0 | 0 |
| 0.0 | 0 |
| 0.0 | 0 |
| 0.0 | 0 |
| 0.0 | 0 |
| 0.0 | 0 |
| 0.0 | 0 |
| 0.0 | 0 |
| 0.0 | 0 |
| 0.0 | 0 |
| 0.0 | 0 |
| 0.0 | 0 |
| 0.0 | 0 |
| 0.0 | 0 |
| 0.0 | 0 |
| 0.0 | 0 |
| 0.0 | 0 |
| 0.0 | 0 |
| 0.0 | 0 |
| 0.0 | 0 |
| 0.0 | 0 |
| 0.0 | 0 |
| 0.0 | 0 |
| 0.0 | 0 |
| 0.0 | 0 |
| 0.0 | 0 |
| 0.0 | 0 |
| 0.0 | 0 |
| 0.0 | 0 |
| 0.0 | 0 |
| 0.0 | 0 |
| 0.0 | 0 |
| 0.0 | 0 |
| 0.0 | 0 |
| 0.0 | 0 |
| 0.0 | 0 |
| 0.0 | 0 |
| 0.0 | 0 |
| 0.0 | 0 |
| 0.0 | 0 |
| 0.0 | 0 |
| 0.0 | 0 |
| 0.0 | 0 |
| 0.0 | 0 |
| 0.0 | 0 |
| 0.0 | 0 |
| 0.0 | 0 |
| 0.0 | 0 |
| 0.0 | 0 |
| 0.0 | 0 |
| 0.0 | 0 |
| 0.0 | 0 |
| 0.0 | 0 |
| 0.0 | 0 |
| 0.0 | 0 |
| 0.0 | 0 |
| 0.0 | 0 |
| 0.0 | 0 |
| 0.0 | 0 |
| 0.0 | 0 |
| 0.0 | 0 |
| 0.0 | 0 |
| 0.0 | 0 |
| 0.0 | 0 |
| 0.0 | 0 |
| 0.0 | 0 |
| 0.0 | 0 |
| 0.0 | 0 |
| 0.0 | 0 |
| 0.0 | 0 |
| 0.0 | 0 |
| 0.0 | 0 |
| 0.0 | 0 |
| 0.0 | 0 |
| 0.0 | 0 |
| 0.0 | 0 |
| 0.0 | 0 |
| 0.0 | 0 |
| 0.0 | 0 |
| 0.0 | 0 |
| 0.0 | 0 |
| 0.0 | 0 |
| 0.0 | 0 |
| 0.0 | 0 |
| 0.0 | 0 |
| 0.0 | 0 |
| 0.0 | 0 |
| 0.0 | 0 |
| 0.0 | 0 |
| 0.0 | 0 |
| 0.0 | 0 |
| 0.0 | 0 |
| 0.0 | 0 |
| 0.0 | 0 |
| 0.0 | 0 |
| 0.0 | 0 |
| 0.0 | 0 |
| 0.0 | 0 |
| 0.0 | 0 |
| 0.0 | 0 |
| 0.0 | 0 |
| 0.0 | 0 |
| 13383.0 | 62668 |
| 13316.0 | 62564 |
| 13267.0 | 62492 |
| 13247.0 | 62424 |
| 13199.0 | 62399 |
| 13179.0 | 62355 |
| 13151.0 | 62356 |
| 13141.0 | 62367 |
| 13131.0 | 62338 |
| 13160.0 | 62326 |
| 13176.0 | 62313 |
| 13177.0 | 62325 |
| 13190.0 | 62313 |
| 13186.0 | 62335 |
| 13186.0 | 62350 |
| 13219.0 | 62350 |
| 13192.0 | 62368 |
| 13199.0 | 62375 |
| 13172.0 | 62419 |
| 13165.0 | 62456 |
| 13176.0 | 62472 |
| 13191.0 | 62492 |
| 13121.0 | 62499 |
| 13076.0 | 62533 |
| 13074.0 | 62564 |
| 13092.0 | 62631 |
| 13100.0 | 62707 |
| 13087.0 | 62703 |
| 13099.0 | 62757 |
| 13106.0 | 62827 |
| 13098.0 | 62879 |
| 13115.0 | 62986 |
| 13135.0 | 63087 |
| 13181.0 | 63207 |
| 13224.0 | 63314 |
| 13248.0 | 63389 |
| 13244.0 | 63467 |
| 13232.0 | 63539 |
| 13260.0 | 63691 |
| 13254.0 | 63821 |
| 13269.0 | 64021 |
| 13232.0 | 64178 |
| 13249.0 | 64379 |
| 13233.0 | 64581 |
| 13223.0 | 64757 |
| 13177.0 | 64948 |
| 13121.0 | 65122 |
| 13026.0 | 65257 |
| 12986.0 | 65506 |
| 12986.0 | 65506 |
| 12835.0 | 65790 |
| 12706.0 | 66037 |
| 12653.0 | 66312 |
| 12529.0 | 66472 |
| 12410.0 | 66719 |
| 12284.0 | 67048 |
| 12182.0 | 67345 |
| 12190.0 | 67560 |
| 12219.0 | 67787 |
| 12245.0 | 68029 |
| 12307.0 | 68317 |
| 12201.0 | 68672 |
| 12137.0 | 68992 |
| 12091.0 | 69322 |
| 12201.0 | 69527 |
| 12220.0 | 69837 |
| 12223.0 | 70159 |
| 12265.0 | 70454 |
| 12411.0 | 70653 |
| 12524.0 | 70877 |
| 12605.0 | 71168 |
| 12789.0 | 71365 |
| 12933.0 | 71564 |
| 13088.0 | 71771 |
| 13262.0 | 71960 |
| 13436.0 | 72173 |
| 13692.0 | 72327 |
| 13973.0 | 72506 |
| 14304.0 | 72678 |
| 14304.0 | 72678 |
| 14216.0 | 72904 |
| 13901.0 | 73113 |
| 14209.0 | 73372 |
| 14513.0 | 73640 |
| 14748.0 | 73884 |
| 15006.0 | 74082 |
| 15228.0 | 74229 |
| 15739.0 | 74281 |
| 15813.0 | 74535 |
| 16032.0 | 74739 |
| 16269.0 | 74930 |
| 16311.0 | 75096 |
| 16535.0 | 75173 |
| 16617.0 | 75403 |
| 16663.0 | 75616 |
| 16953.0 | 75690 |
| 16973.0 | 75839 |
| 16856.0 | 76062 |
| 16719.0 | 76309 |
| 16518.0 | 76547 |
| 16345.0 | 76758 |
| 16352.0 | 76722 |
| 16203.0 | 76794 |
| 16237.0 | 76745 |
| 16046.0 | 76892 |
| 15768.0 | 76997 |
| 15540.0 | 77047 |
| 15300.0 | 77093 |
| 15052.0 | 77104 |
| 14878.0 | 77077 |
| 14552.0 | 77177 |
| 14552.0 | 77177 |
| 14438.0 | 77044 |
| 14974.0 | 76581 |
| 14631.0 | 76511 |
| 14319.0 | 76372 |
| 14083.0 | 76234 |
| 13734.0 | 76228 |
| 13449.0 | 76159 |
| 13218.0 | 76059 |
| 13030.0 | 75941 |
| 12896.0 | 75766 |
| 12923.0 | 75427 |
| 12803.0 | 75250 |
| 12852.0 | 74927 |
| 12950.0 | 74588 |
| 13009.0 | 74254 |
| 13026.0 | 73930 |
| 13037.0 | 73624 |
| 12899.0 | 73397 |
| 13003.0 | 73040 |
| 13106.0 | 72710 |
| 13126.0 | 72398 |
| 12897.0 | 72116 |
| 12787.0 | 71825 |
| 12705.0 | 71547 |
| 12641.0 | 71256 |
| 12577.0 | 70933 |
| 12578.0 | 70592 |
| 12574.0 | 70274 |
| 12590.0 | 69943 |
| 12600.0 | 69622 |
| 12604.0 | 69268 |
| 12585.0 | 68899 |
| 12598.0 | 68504 |
| 12613.0 | 68117 |
| 12628.0 | 67706 |
| 12637.0 | 67334 |
| 12639.0 | 66981 |
| 12625.0 | 66609 |
| 12660.0 | 66274 |
| 12678.0 | 65919 |
| 12607.0 | 65614 |
| 12642.0 | 65286 |
| 12644.0 | 64986 |
| 12621.0 | 64615 |
| 12616.0 | 64252 |
| 12626.0 | 63875 |
| 12619.0 | 63611 |
| 12568.0 | 63258 |
| 12493.0 | 62830 |
| 12511.0 | 62493 |
| 12513.0 | 62156 |
| 12484.0 | 61796 |
| 12451.0 | 61442 |
| 12438.0 | 61121 |
| 12424.0 | 60789 |
| 12285.0 | 60368 |
| 12301.0 | 60051 |
| 12332.0 | 59750 |
| 12257.0 | 59346 |
| 12299.0 | 59060 |
| 12299.0 | 59060 |
| 12306.0 | 58670 |
| 12342.0 | 58315 |
| 12373.0 | 57969 |
| 12373.0 | 57969 |
| 12455.0 | 57589 |
| 12417.0 | 57171 |
| 12371.0 | 56743 |
| 12378.0 | 56358 |
| 12357.0 | 55978 |
| 12430.0 | 55600 |
| 12477.0 | 55246 |
| 12494.0 | 54909 |
| 12507.0 | 54573 |
| 12482.0 | 54229 |
| 12433.0 | 53885 |
| 12392.0 | 53546 |
| 12251.0 | 53354 |
| 12129.0 | 53127 |
| 12139.0 | 52792 |
| 12006.0 | 52550 |
| 12063.0 | 52126 |
| 12092.0 | 51716 |
| 12303.0 | 51329 |
| 12427.0 | 50986 |
| 12541.0 | 50662 |
| 12697.0 | 50355 |
| 12874.0 | 49892 |
| 12982.0 | 49623 |
| 12986.0 | 49017 |
| 13043.0 | 48423 |
| 13090.0 | 47935 |
| 13103.0 | 47382 |
| 13123.0 | 46933 |
| 13137.0 | 46534 |
| 13147.0 | 46158 |
| 13158.0 | 45793 |
| 13123.0 | 45482 |
| 13099.0 | 45149 |
| 13059.0 | 44924 |
| 13121.0 | 44636 |
| 13169.0 | 44213 |
| 13217.0 | 43806 |
| 13240.0 | 43467 |
| 13254.0 | 43127 |
| 13270.0 | 42815 |
| 13247.0 | 42378 |
| 13199.0 | 41917 |
| 13180.0 | 41568 |
| 13178.0 | 41206 |
| 13154.0 | 40833 |
| 13184.0 | 40503 |
| 13200.0 | 40152 |
| 13251.0 | 39827 |
| 13347.0 | 39533 |
| 13370.0 | 39192 |
| 13370.0 | 38858 |
| 13448.0 | 38529 |
| 13482.0 | 38201 |
| 13558.0 | 37839 |
| 13615.0 | 37499 |
| 13625.0 | 37151 |
| 13564.0 | 36772 |
| 13643.0 | 36255 |
| 13518.0 | 35982 |
| 13497.0 | 35753 |
| 13497.0 | 35753 |
| 13530.0 | 35385 |
| 13474.0 | 35030 |
| 13474.0 | 35030 |
| 13353.0 | 34598 |
| 13155.0 | 34332 |
| 13022.0 | 34079 |
| 12918.0 | 33719 |
| 12794.0 | 33392 |
| 12625.0 | 33133 |
| 12402.0 | 32914 |
| 12208.0 | 32642 |
| 11947.0 | 32433 |
| 11735.0 | 32197 |
| 11531.0 | 31997 |
| 11317.0 | 31834 |
| 11077.0 | 31690 |
| 10830.0 | 31564 |
| 10562.0 | 31451 |
| 10306.0 | 31357 |
| 10028.0 | 31281 |
| 9735.0 | 31228 |
| 9445.0 | 31175 |
| 9181.0 | 31108 |
| 9065.0 | 30918 |
| 8729.0 | 30892 |
| 8446.0 | 30838 |
| 8181.0 | 30771 |
| 7971.0 | 30700 |
| 7786.0 | 30613 |
| 7557.0 | 30480 |
| 7337.0 | 30365 |
| 7029.0 | 30230 |
| 6803.0 | 30102 |
| 6648.0 | 29871 |
| 6457.0 | 29755 |
| 6192.0 | 29514 |
| 5961.0 | 29348 |
| 5808.0 | 29102 |
| 5696.0 | 28880 |
| 5608.0 | 28678 |
| 5482.0 | 28386 |
| 5420.0 | 28186 |
| 5369.0 | 27945 |
| 5351.0 | 27727 |
| 5424.0 | 27512 |
| 5408.0 | 27311 |
| 5447.0 | 27088 |
| 5493.0 | 26857 |
| 5589.0 | 26619 |
| 5682.0 | 26449 |
| 5848.0 | 26271 |
| 5995.0 | 26089 |
| 6166.0 | 25964 |
| 6389.0 | 25788 |
| 6655.0 | 25636 |
| 6894.0 | 25517 |
| 7145.0 | 25418 |
| 7373.0 | 25376 |
| 7631.0 | 25336 |
| 7873.0 | 25340 |
| 7873.0 | 25340 |
| 8151.0 | 25372 |
| 8486.0 | 25358 |
| 8814.0 | 25321 |
| 9131.0 | 25348 |
| 9443.0 | 25489 |
| 9744.0 | 25510 |
| 10120.0 | 25591 |
| 10484.0 | 25665 |
| 10809.0 | 25736 |
| 11120.0 | 25795 |
| 11398.0 | 25892 |
| 11735.0 | 25958 |
| 12081.0 | 26019 |
| 12431.0 | 26101 |
| 12731.0 | 26243 |
| 13045.0 | 26288 |
| 13389.0 | 26301 |
| 13852.0 | 26198 |
| 14288.0 | 26134 |
| 14694.0 | 26164 |
| 15076.0 | 26199 |
| 15447.0 | 26252 |
| 15806.0 | 26291 |
| 16163.0 | 26373 |
| 16507.0 | 26467 |
| 16854.0 | 26504 |
| 17276.0 | 26805 |
| 17677.0 | 27075 |
| 17978.0 | 27031 |
| 18279.0 | 26980 |
| 18589.0 | 26963 |
| 18901.0 | 26974 |
| 19130.0 | 27734 |
| 19415.0 | 27740 |
| 19694.0 | 27741 |
| 19978.0 | 27748 |
| 20256.0 | 27676 |
| 20509.0 | 27642 |
| 20787.0 | 27624 |
| 21062.0 | 27569 |
| 21330.0 | 27507 |
| 21526.0 | 27495 |
| 21838.0 | 27429 |
| 22215.0 | 27460 |
| 22563.0 | 27578 |
| 22875.0 | 27686 |
| 23202.0 | 27737 |
| 23468.0 | 27917 |
| 23761.0 | 27789 |
| 24062.0 | 27724 |
| 24313.0 | 27872 |
| 24539.0 | 28028 |
| 24793.0 | 28039 |
| 24997.0 | 28270 |
| 25161.0 | 28471 |
| 25335.0 | 28729 |
| 25488.0 | 29025 |
| 25513.0 | 29011 |
| 25584.0 | 29085 |
| 25640.0 | 29203 |
| 25691.0 | 29348 |
| 25719.0 | 29518 |
| 25739.0 | 29725 |
| 25640.0 | 29970 |
| 25774.0 | 30522 |
| 25660.0 | 30814 |
| 25592.0 | 31137 |
| 25500.0 | 31474 |
| 25426.0 | 31721 |
| 25349.0 | 31951 |
| 25245.0 | 32201 |
| 25104.0 | 32433 |
| 24946.0 | 32581 |
| 24762.0 | 32682 |
| 24540.0 | 32747 |
| 24328.0 | 32896 |
| 24111.0 | 33025 |
| 23901.0 | 33113 |
| 23686.0 | 33199 |
| 23453.0 | 33250 |
| 23161.0 | 33254 |
| 22877.0 | 33244 |
| 22854.0 | 33618 |
| 22757.0 | 33930 |
| 22611.0 | 34157 |
| 22489.0 | 34335 |
| 22310.0 | 34423 |
| 21818.0 | 34047 |
| 21359.0 | 33785 |
| 21031.0 | 33675 |
| 20674.0 | 33590 |
| 20344.0 | 33525 |
| 20026.0 | 33476 |
| 19657.0 | 33478 |
| 19319.0 | 33455 |
| 19028.0 | 33399 |
| 18716.0 | 33367 |
| 18416.0 | 33385 |
| 18163.0 | 33379 |
| 17925.0 | 33406 |
| 17639.0 | 33321 |
| 17363.0 | 33406 |
| 17067.0 | 33459 |
| 16764.0 | 33574 |
| 16609.0 | 33707 |
| 16389.0 | 33853 |
| 16193.0 | 33993 |
| 15995.0 | 34126 |
| 15825.0 | 34331 |
| 15755.0 | 34581 |
| 15616.0 | 34808 |
| 15539.0 | 35037 |
| 15539.0 | 35037 |
| 15525.0 | 35332 |
| 15504.0 | 35663 |
| 15495.0 | 35978 |
| 15572.0 | 36216 |
| 15660.0 | 36474 |
| 15785.0 | 36719 |
| 15904.0 | 36953 |
| 16003.0 | 37223 |
| 16136.0 | 37487 |
| 16242.0 | 37605 |
| 16546.0 | 37697 |
| 16858.0 | 37787 |
| 16993.0 | 37867 |
| 17178.0 | 37945 |
| 17417.0 | 38021 |
| 17664.0 | 38082 |
| 17921.0 | 38134 |
| 18213.0 | 38183 |
| 18503.0 | 38231 |
| 18822.0 | 38289 |
| 19102.0 | 38300 |
| 19396.0 | 38313 |
| 19729.0 | 38294 |
| 20046.0 | 38304 |
| 20362.0 | 38280 |
| 20700.0 | 38253 |
| 21076.0 | 38201 |
| 21391.0 | 38278 |
| 21714.0 | 38398 |
| 21714.0 | 38398 |
| 22142.0 | 38385 |
| 22142.0 | 38385 |
| 22642.0 | 38396 |
| 23110.0 | 38344 |
| 23540.0 | 38310 |
| 23972.0 | 38278 |
| 24373.0 | 38269 |
| 24778.0 | 38262 |
| 25165.0 | 38235 |
| 25545.0 | 38225 |
| 25924.0 | 38255 |
| 26301.0 | 38276 |
| 26669.0 | 38239 |
| 27029.0 | 38258 |
| 27294.0 | 38118 |
| 27654.0 | 38130 |
| 27978.0 | 38145 |
| 27978.0 | 38145 |
| 28390.0 | 38153 |
| 28616.0 | 37975 |
| 29034.0 | 38049 |
| 29490.0 | 38125 |
| 29901.0 | 38133 |
| 30277.0 | 38135 |
| 30277.0 | 38135 |
| 30960.0 | 37861 |
| 30960.0 | 37861 |
| 31490.0 | 37836 |
| 31490.0 | 37836 |
| 32082.0 | 37459 |
| 32557.0 | 37659 |
| 33041.0 | 37779 |
| 33507.0 | 37713 |
| 33880.0 | 37806 |
| 34258.0 | 37915 |
| 34623.0 | 38000 |
| 35014.0 | 38036 |
| 35343.0 | 38054 |
| 35660.0 | 38052 |
| 35961.0 | 38029 |
| 36246.0 | 38022 |
| 36360.0 | 38033 |
| 36453.0 | 38040 |
| 36589.0 | 38062 |
| 36771.0 | 38081 |
| 37465.0 | 37874 |
| 37722.0 | 38026 |
| 37903.0 | 38035 |
| 38136.0 | 38049 |
| 38419.0 | 38087 |
| 38661.0 | 38149 |
| 38904.0 | 38228 |
| 39256.0 | 38429 |
| 39556.0 | 38597 |
| 39837.0 | 38779 |
| 40079.0 | 38949 |
| 40341.0 | 39230 |
| 40552.0 | 39497 |
| 40719.0 | 39678 |
| 40919.0 | 39905 |
| 41077.0 | 40139 |
| 41214.0 | 40387 |
| 41345.0 | 40647 |
| 41448.0 | 40915 |
| 41534.0 | 41208 |
| 41598.0 | 41516 |
| 41660.0 | 41828 |
| 41710.0 | 42124 |
| 41758.0 | 42443 |
| 41813.0 | 42785 |
| 41866.0 | 43114 |
| 41969.0 | 43456 |
| 42021.0 | 43853 |
| 42032.0 | 44237 |
| 42068.0 | 44581 |
| 42061.0 | 44878 |
| 42078.0 | 45175 |
| 42128.0 | 45486 |
| 42133.0 | 45871 |
| 42090.0 | 46314 |
| 42102.0 | 46665 |
| 42072.0 | 47027 |
| 42098.0 | 47330 |
| 42205.0 | 47517 |
| 42204.0 | 47799 |
| 42268.0 | 48159 |
| 42290.0 | 48557 |
| 42221.0 | 48961 |
| 42175.0 | 49372 |
| 42139.0 | 49769 |
| 42138.0 | 50154 |
| 42082.0 | 50526 |
| 42050.0 | 50876 |
| 42012.0 | 51209 |
| 41981.0 | 51537 |
| 41935.0 | 51902 |
| 41976.0 | 52308 |
| 41560.0 | 52110 |
| 41560.0 | 52110 |
| 41668.0 | 52699 |
| 41550.0 | 52863 |
| 41519.0 | 53206 |
| 41599.0 | 53827 |
| 41583.0 | 54382 |
| 41591.0 | 54847 |
| 41600.0 | 55250 |
| 41808.0 | 55586 |
| 41808.0 | 55586 |
| 41808.0 | 55586 |
| 41901.0 | 56144 |
| 41781.0 | 56612 |
| 41781.0 | 56612 |
| 41821.0 | 57240 |
| 41860.0 | 57818 |
| 41860.0 | 57818 |
| 41860.0 | 57818 |
| 41860.0 | 57818 |
| 41978.0 | 58498 |
| 40769.0 | 60149 |
| 40769.0 | 60149 |
| 40769.0 | 60149 |
| 41127.0 | 60547 |
| 41352.0 | 60927 |
| 41217.0 | 61525 |
| 41217.0 | 61525 |
| 41217.0 | 61525 |
| 41360.0 | 61996 |
| 41482.0 | 62368 |
| 41706.0 | 62615 |
| 41770.0 | 62943 |
| 41770.0 | 62943 |
| 41783.0 | 63339 |
| 41487.0 | 63707 |
| 41835.0 | 63805 |
| 41835.0 | 63805 |
| 41835.0 | 63805 |
| 41835.0 | 63805 |
| 41939.0 | 64183 |
| 41638.0 | 64810 |
| 41465.0 | 65326 |
| 41488.0 | 65642 |
| 41376.0 | 66064 |
| 41195.0 | 66395 |
| 41073.0 | 66657 |
| 40824.0 | 66907 |
| 40953.0 | 67141 |
| 41230.0 | 67329 |
| 41320.0 | 67579 |
| 41548.0 | 67808 |
| 41783.0 | 68012 |
| 41484.0 | 68202 |
| 41708.0 | 68391 |
| 41384.0 | 68574 |
| 41560.0 | 68769 |
| 41626.0 | 68955 |
| 41334.0 | 69140 |
| 41417.0 | 69316 |
| 41556.0 | 69480 |
| 42331.0 | 69432 |
| 41870.0 | 69662 |
| 41528.0 | 69888 |
| 42389.0 | 70113 |
| 41942.0 | 70317 |
| 41611.0 | 70504 |
| 41343.0 | 70705 |
| 42225.0 | 70927 |
| 41837.0 | 71142 |
| 41550.0 | 71348 |
| 42373.0 | 71563 |
| 41971.0 | 71763 |
| 41646.0 | 71950 |
| 41412.0 | 72141 |
| 41412.0 | 72141 |
| 41325.0 | 72472 |
| 42212.0 | 72697 |
| 41956.0 | 72889 |
| 41822.0 | 73099 |
| 41804.0 | 73282 |
| 41837.0 | 73496 |
| 41873.0 | 73690 |
| 41940.0 | 73857 |
| 42085.0 | 74021 |
| 42248.0 | 74187 |
| 42445.0 | 74377 |
| 42645.0 | 74561 |
| 42854.0 | 74722 |
| 43084.0 | 74876 |
| 43322.0 | 74982 |
| 43544.0 | 75078 |
| 43771.0 | 75158 |
| 44016.0 | 75218 |
| 44270.0 | 75268 |
| 44548.0 | 75324 |
| 44830.0 | 75360 |
| 45134.0 | 75421 |
| 45396.0 | 75443 |
| 45609.0 | 75496 |
| 45888.0 | 75532 |
| 46144.0 | 75533 |
| 46408.0 | 75515 |
| 46684.0 | 75435 |
| 46967.0 | 75388 |
| 47274.0 | 75378 |
| 47465.0 | 75347 |
| 47651.0 | 75275 |
| 47904.0 | 75232 |
| 48143.0 | 75227 |
| 48328.0 | 75229 |
| 48665.0 | 75236 |
| 48918.0 | 75230 |
| 48918.0 | 75230 |
| 48918.0 | 75230 |
| 48918.0 | 75230 |
| 48918.0 | 75230 |
| 49546.0 | 75270 |
| 49546.0 | 75270 |
| 49546.0 | 75270 |
| 49546.0 | 75270 |
| 49546.0 | 75270 |
| 49546.0 | 75270 |
| 50166.0 | 75130 |
| 50166.0 | 75130 |
| 50166.0 | 75130 |
| 50166.0 | 75130 |
| 50166.0 | 75130 |
| 50166.0 | 75130 |
| 50166.0 | 75130 |
| 50166.0 | 75130 |
| 50166.0 | 75130 |
| 50166.0 | 75130 |
| 50166.0 | 75130 |
| 50166.0 | 75130 |
| 50166.0 | 75130 |
| 50995.0 | 75432 |
| 51428.0 | 75006 |
| 51745.0 | 74893 |
| 51905.0 | 74594 |
| 52074.0 | 74557 |
| 52186.0 | 74559 |
| 52280.0 | 74642 |
| 52277.0 | 74962 |
| 52270.0 | 75207 |
| 52290.0 | 75588 |
| 52219.0 | 75718 |
| 52151.0 | 75745 |
| 52119.0 | 75747 |
| 52119.0 | 75747 |
| 52177.0 | 76285 |
| 51935.0 | 76530 |
| 51935.0 | 76530 |
| 51745.0 | 76683 |
| 51502.0 | 76790 |
| 51277.0 | 76858 |
| 51094.0 | 76928 |
| 50908.0 | 77021 |
| 51028.0 | 76682 |
| 50783.0 | 76837 |
| 50551.0 | 76880 |
| 50356.0 | 76870 |
| 50186.0 | 76893 |
| 50003.0 | 76893 |
| 49790.0 | 76907 |
| 49559.0 | 76912 |
| 49295.0 | 76896 |
| 49112.0 | 76896 |
| 48865.0 | 76885 |
| 48703.0 | 76878 |
| 48468.0 | 76860 |
| 48218.0 | 76841 |
| 48016.0 | 76789 |
| 47802.0 | 76765 |
| 47581.0 | 76744 |
| 47363.0 | 76698 |
| 47152.0 | 76690 |
| 46917.0 | 76645 |
| 46690.0 | 76625 |
| 46470.0 | 76593 |
| 46257.0 | 76530 |
| 46047.0 | 76457 |
| 45862.0 | 76343 |
| 45614.0 | 76295 |
| 45415.0 | 76198 |
| 45197.0 | 76130 |
| 44983.0 | 76077 |
| 44764.0 | 76024 |
| 44540.0 | 75959 |
| 44309.0 | 75878 |
| 44109.0 | 75803 |
| 43923.0 | 75717 |
| 43758.0 | 75637 |
| 43605.0 | 75514 |
| 43463.0 | 75400 |
| 43355.0 | 75276 |
| 43254.0 | 75175 |
| 43165.0 | 75027 |
| 0.0 | 0 |
| 0.0 | 0 |
| 0.0 | 0 |
| 0.0 | 0 |
| 0.0 | 0 |
| 0.0 | 0 |
| 0.0 | 0 |
| 0.0 | 0 |
| 0.0 | 0 |
| 0.0 | 0 |
| 0.0 | 0 |
| 0.0 | 0 |
| 0.0 | 0 |
| 0.0 | 0 |
| 0.0 | 0 |
| 0.0 | 0 |
| 0.0 | 0 |
| 0.0 | 0 |
| 0.0 | 0 |
| 0.0 | 0 |
| 0.0 | 0 |
| 0.0 | 0 |
| 0.0 | 0 |
| 0.0 | 0 |
| 0.0 | 0 |
| 0.0 | 0 |
| 0.0 | 0 |
| 0.0 | 0 |
| 0.0 | 0 |
| 0.0 | 0 |
| 0.0 | 0 |
| 0.0 | 0 |
| 0.0 | 0 |
| 0.0 | 0 |
| 0.0 | 0 |
| 0.0 | 0 |
| 0.0 | 0 |
| 0.0 | 0 |
| 0.0 | 0 |
| 0.0 | 0 |
| 0.0 | 0 |
| 0.0 | 0 |
| 0.0 | 0 |
| 0.0 | 0 |
| 0.0 | 0 |
| 0.0 | 0 |
| 0.0 | 0 |
| 0.0 | 0 |
| 0.0 | 0 |
| 0.0 | 0 |
| 0.0 | 0 |
| 0.0 | 0 |
| 0.0 | 0 |
| 0.0 | 0 |
| 0.0 | 0 |
| 0.0 | 0 |
| 0.0 | 0 |
| 0.0 | 0 |
| 0.0 | 0 |
| 0.0 | 0 |
| 0.0 | 0 |
| 0.0 | 0 |
| 0.0 | 0 |
| 0.0 | 0 |
| 0.0 | 0 |
| 0.0 | 0 |
| 0.0 | 0 |
| 0.0 | 0 |
| 0.0 | 0 |
| 0.0 | 0 |
| 0.0 | 0 |
| 0.0 | 0 |
| 0.0 | 0 |
| 0.0 | 0 |
| 0.0 | 0 |
| 0.0 | 0 |
| 0.0 | 0 |
| 0.0 | 0 |
| 0.0 | 0 |
| 0.0 | 0 |
| 0.0 | 0 |
| 0.0 | 0 |
| 0.0 | 0 |
| 0.0 | 0 |
| 0.0 | 0 |
| 0.0 | 0 |
| 0.0 | 0 |
| 0.0 | 0 |
| 0.0 | 0 |
| 0.0 | 0 |
| 0.0 | 0 |
| 0.0 | 0 |
| 0.0 | 0 |
| 0.0 | 0 |
| 0.0 | 0 |
| 0.0 | 0 |
| 0.0 | 0 |
| 0.0 | 0 |
| 0.0 | 0 |
| 0.0 | 0 |
| 0.0 | 0 |
| 0.0 | 0 |
| 0.0 | 0 |
| 0.0 | 0 |
| 0.0 | 0 |
| 0.0 | 0 |
| 0.0 | 0 |
| 0.0 | 0 |
| 0.0 | 0 |
| 0.0 | 0 |
| 0.0 | 0 |
| 0.0 | 0 |
| 0.0 | 0 |
| 0.0 | 0 |
| 0.0 | 0 |
| 0.0 | 0 |
| 0.0 | 0 |
| 0.0 | 0 |
| 0.0 | 0 |
| 0.0 | 0 |
| 0.0 | 0 |
| 0.0 | 0 |
| 0.0 | 0 |
| 0.0 | 0 |
| 0.0 | 0 |
| 0.0 | 0 |
| 0.0 | 0 |
| 0.0 | 0 |
| 0.0 | 0 |
| 0.0 | 0 |
| 0.0 | 0 |
| 0.0 | 0 |
| 0.0 | 0 |
| 0.0 | 0 |
| 0.0 | 0 |
| 0.0 | 0 |
| 0.0 | 0 |
| 0.0 | 0 |
| 42531.0 | 73809 |
| 42180.0 | 73743 |
| 41930.0 | 73716 |
| 41727.0 | 73665 |
| 41582.0 | 73640 |
| 41540.0 | 73770 |
| 41540.0 | 73770 |
| 42270.0 | 73486 |
| 41963.0 | 73507 |
| 41741.0 | 73537 |
| 41579.0 | 73576 |
| 41579.0 | 73576 |
| 41445.0 | 73584 |
| 41297.0 | 73566 |
| 41283.0 | 73558 |
| 41247.0 | 73554 |
| 41356.0 | 73498 |
| 41419.0 | 73421 |
| 41493.0 | 73333 |
| 41483.0 | 73231 |
| 42012.0 | 73077 |
| 41678.0 | 72937 |
| 41589.0 | 72786 |
| 41588.0 | 72636 |
| 0.0 | 0 |
| 0.0 | 0 |
| 0.0 | 0 |
| 0.0 | 0 |
| 0.0 | 0 |
| 0.0 | 0 |
| 0.0 | 0 |
| 0.0 | 0 |
| 0.0 | 0 |
| 0.0 | 0 |
| 0.0 | 0 |
| 0.0 | 0 |
| 0.0 | 0 |
| 0.0 | 0 |
| 0.0 | 0 |
| 0.0 | 0 |
| 0.0 | 0 |
| 0.0 | 0 |
| 0.0 | 0 |
| 0.0 | 0 |
| 0.0 | 0 |
| 0.0 | 0 |
| 0.0 | 0 |
| 0.0 | 0 |
| 0.0 | 0 |
| 0.0 | 0 |
| 0.0 | 0 |
| 0.0 | 0 |
| 0.0 | 0 |
| 0.0 | 0 |
| 0.0 | 0 |
| 0.0 | 0 |
| 0.0 | 0 |
| 0.0 | 0 |
| 0.0 | 0 |
| 0.0 | 0 |
| 0.0 | 0 |
| 0.0 | 0 |
| 0.0 | 0 |
| 0.0 | 0 |
| 0.0 | 0 |
| 0.0 | 0 |
| 0.0 | 0 |
| 0.0 | 0 |
| 0.0 | 0 |
| 0.0 | 0 |
| 0.0 | 0 |
| 0.0 | 0 |
| 0.0 | 0 |
| 0.0 | 0 |
| 0.0 | 0 |
| 0.0 | 0 |
| 0.0 | 0 |
| 0.0 | 0 |
| 0.0 | 0 |
| 0.0 | 0 |
| 0.0 | 0 |
| 0.0 | 0 |
| 0.0 | 0 |
| 0.0 | 0 |
| 0.0 | 0 |
| 0.0 | 0 |
| 0.0 | 0 |
| 0.0 | 0 |
| 0.0 | 0 |
| 0.0 | 0 |
| 0.0 | 0 |
| 0.0 | 0 |
| 0.0 | 0 |
| 0.0 | 0 |
| 0.0 | 0 |
| 0.0 | 0 |
| 0.0 | 0 |
| 0.0 | 0 |
| 0.0 | 0 |
| 0.0 | 0 |
| 0.0 | 0 |
| 0.0 | 0 |
| 0.0 | 0 |
| 0.0 | 0 |
| 0.0 | 0 |
| 0.0 | 0 |
| 0.0 | 0 |
| 0.0 | 0 |
| 0.0 | 0 |
| 0.0 | 0 |
| 0.0 | 0 |
| 0.0 | 0 |
| 0.0 | 0 |
| 0.0 | 0 |
| 0.0 | 0 |
| 0.0 | 0 |
| 0.0 | 0 |
| 0.0 | 0 |
| 0.0 | 0 |
| 0.0 | 0 |
| 0.0 | 0 |
| 0.0 | 0 |
| 0.0 | 0 |
| 0.0 | 0 |
| 0.0 | 0 |
| 0.0 | 0 |
| 0.0 | 0 |
| 0.0 | 0 |
| 0.0 | 0 |
| 0.0 | 0 |
| 0.0 | 0 |
| 0.0 | 0 |
| 0.0 | 0 |
| 0.0 | 0 |
| 0.0 | 0 |
| 0.0 | 0 |
| 0.0 | 0 |
| 0.0 | 0 |
| 0.0 | 0 |
| 0.0 | 0 |
| 0.0 | 0 |
| 0.0 | 0 |
| 0.0 | 0 |
| 0.0 | 0 |
| 0.0 | 0 |
| 0.0 | 0 |
| 0.0 | 0 |
| 0.0 | 0 |
| 0.0 | 0 |
| 0.0 | 0 |
| 0.0 | 0 |
| 0.0 | 0 |
| 0.0 | 0 |
| 0.0 | 0 |
| 0.0 | 0 |
| 0.0 | 0 |
| 0.0 | 0 |
| 0.0 | 0 |
| 0.0 | 0 |
| 0.0 | 0 |
| 0.0 | 0 |
| 0.0 | 0 |
| 40921.0 | 23959 |
| 40951.0 | 23993 |
| 40953.0 | 23906 |
| 40933.0 | 23762 |
| 40959.0 | 23631 |
| 40971.0 | 23359 |
| 40988.0 | 23146 |
| 40988.0 | 22856 |
| 40979.0 | 22546 |
| 41013.0 | 22250 |
| 41052.0 | 21959 |
| 41058.0 | 21609 |
| 40947.0 | 21487 |
| 41027.0 | 21106 |
| 41029.0 | 20789 |
| 41016.0 | 20437 |
| 41001.0 | 20088 |
| 40971.0 | 19736 |
| 40942.0 | 19367 |
| 40848.0 | 19100 |
| 40750.0 | 18810 |
| 40681.0 | 18504 |
| 40626.0 | 18182 |
| 40541.0 | 17884 |
| 40566.0 | 17481 |
| 40641.0 | 17017 |
| 40701.0 | 16608 |
| 40740.0 | 16232 |
| 40772.0 | 15901 |
| 40711.0 | 15534 |
| 40682.0 | 15131 |
| 40714.0 | 14673 |
| 40652.0 | 14223 |
| 40640.0 | 13798 |
| 40570.0 | 13384 |
| 40551.0 | 13034 |
| 40544.0 | 12694 |
| 40595.0 | 12378 |
| 40608.0 | 12027 |
| 40677.0 | 11741 |
| 40671.0 | 11385 |
| 40698.0 | 11070 |
| 40678.0 | 10736 |
| 40664.0 | 10417 |
| 40642.0 | 10132 |
| 40640.0 | 9854 |
| 40610.0 | 9559 |
| 40578.0 | 9303 |
| 40539.0 | 9032 |
| 40539.0 | 8796 |
| 40515.0 | 8533 |
| 40516.0 | 8286 |
| 40517.0 | 8067 |
| 40524.0 | 7849 |
| 40555.0 | 7633 |
| 40621.0 | 7485 |
| 40679.0 | 7366 |
| 40631.0 | 7122 |
| 40669.0 | 6921 |
| 40639.0 | 6664 |
| 40638.0 | 6464 |
| 40642.0 | 6282 |
| 40603.0 | 6059 |
| 40552.0 | 5751 |
| 40624.0 | 5534 |
| 40692.0 | 5365 |
| 40797.0 | 5195 |
| 40914.0 | 5009 |
| 41022.0 | 4913 |
| 41108.0 | 4807 |
| 41278.0 | 4615 |
| 41390.0 | 4471 |
| 41449.0 | 4409 |
| 41575.0 | 4370 |
| 41744.0 | 4325 |
| 41886.0 | 4315 |
| 42087.0 | 4321 |
| 42270.0 | 4383 |
| 42434.0 | 4506 |
| 42523.0 | 4597 |
| 42647.0 | 4755 |
| 42751.0 | 4898 |
| 42829.0 | 5067 |
| 42894.0 | 5252 |
| 42901.0 | 5436 |
| 42946.0 | 5684 |
| 42976.0 | 5895 |
| 42964.0 | 6118 |
| 42977.0 | 6367 |
| 42926.0 | 6647 |
| 42870.0 | 6912 |
| 42819.0 | 7189 |
| 42802.0 | 7466 |
| 42692.0 | 7672 |
| 42641.0 | 7953 |
| 42586.0 | 8220 |
| 42556.0 | 8500 |
| 42532.0 | 8796 |
| 42491.0 | 9085 |
| 42441.0 | 9356 |
| 42404.0 | 9649 |
| 42346.0 | 9961 |
| 42312.0 | 10280 |
| 42261.0 | 10606 |
| 42198.0 | 10937 |
| 42155.0 | 11278 |
| 42128.0 | 11630 |
| 42114.0 | 11995 |
| 42056.0 | 12348 |
| 42048.0 | 12588 |
| 41980.0 | 12976 |
| 41984.0 | 13205 |
| 41985.0 | 13502 |
| 41888.0 | 13865 |
| 41861.0 | 14102 |
| 41849.0 | 14404 |
| 41814.0 | 14734 |
| 41800.0 | 15135 |
| 41776.0 | 15533 |
| 41749.0 | 15897 |
| 41762.0 | 16231 |
| 41766.0 | 16490 |
| 41803.0 | 16787 |
| 41874.0 | 16994 |
| 41948.0 | 17206 |
| 42016.0 | 17433 |
| 42107.0 | 17669 |
| 42229.0 | 17767 |
| 42395.0 | 18008 |
| 42584.0 | 18240 |
| 42769.0 | 18482 |
| 42994.0 | 18708 |
| 43227.0 | 18899 |
| 43461.0 | 19084 |
| 43694.0 | 19243 |
| 43929.0 | 19335 |
| 44197.0 | 19422 |
| 44463.0 | 19502 |
| 44726.0 | 19586 |
| 44998.0 | 19607 |
| 45274.0 | 19637 |
| 45562.0 | 19607 |
| 45852.0 | 19610 |
| 46084.0 | 19636 |
| 46362.0 | 19624 |
| 46636.0 | 19595 |
| 46917.0 | 19577 |
| 47172.0 | 19572 |
| 47393.0 | 19616 |
| 47657.0 | 19642 |
| 47929.0 | 19651 |
| 48197.0 | 19653 |
| 48465.0 | 19626 |
| 48729.0 | 19606 |
| 49174.0 | 19616 |
| 49415.0 | 19579 |
| 49660.0 | 19552 |
| 49740.0 | 19915 |
| 49983.0 | 19799 |
| 50210.0 | 19716 |
| 50404.0 | 19632 |
| 50668.0 | 19556 |
| 50954.0 | 19634 |
| 51080.0 | 19639 |
| 51474.0 | 19946 |
| 51605.0 | 19750 |
| 51820.0 | 19832 |
| 52043.0 | 19740 |
| 52128.0 | 19709 |
| 52442.0 | 19916 |
| 52582.0 | 19919 |
| 52726.0 | 19899 |
| 52846.0 | 19927 |
| 52949.0 | 19950 |
| 53018.0 | 20029 |
| 53098.0 | 20082 |
| 53206.0 | 20210 |
| 53241.0 | 20365 |
| 53335.0 | 20503 |
| 53232.0 | 20684 |
| 53197.0 | 20841 |
| 53130.0 | 20989 |
| 53003.0 | 21081 |
| 52826.0 | 21155 |
| 52690.0 | 21261 |
| 52617.0 | 21340 |
| 52397.0 | 21385 |
| 52229.0 | 21424 |
| 51936.0 | 21450 |
| 51708.0 | 21496 |
| 51422.0 | 21490 |
| 51160.0 | 21516 |
| 50872.0 | 21523 |
| 50655.0 | 21561 |
| 50418.0 | 21496 |
| 50150.0 | 21438 |
| 49907.0 | 21398 |
| 49639.0 | 21344 |
| 49379.0 | 21254 |
| 49136.0 | 21235 |
| 48852.0 | 21160 |
| 48551.0 | 21091 |
| 48254.0 | 21036 |
| 47945.0 | 21006 |
| 47654.0 | 20976 |
| 47349.0 | 20996 |
| 47077.0 | 21029 |
| 46810.0 | 21058 |
| 46539.0 | 21126 |
| 46319.0 | 21227 |
| 46038.0 | 21300 |
| 45761.0 | 21379 |
| 45496.0 | 21413 |
| 45190.0 | 21495 |
| 44942.0 | 21684 |
| 44702.0 | 21889 |
| 44481.0 | 22114 |
| 44214.0 | 22242 |
| 44011.0 | 22413 |
| 43857.0 | 22687 |
| 43717.0 | 22985 |
| 43561.0 | 23228 |
| 43431.0 | 23484 |
| 43318.0 | 23708 |
| 43194.0 | 23985 |
| 43104.0 | 24318 |
| 42983.0 | 24650 |
| 42933.0 | 24980 |
| 42896.0 | 25344 |
| 42811.0 | 25631 |
| 42759.0 | 25963 |
| 42743.0 | 26335 |
| 42732.0 | 26674 |
| 42730.0 | 27093 |
| 42649.0 | 27328 |
| 42510.0 | 27637 |
| 42530.0 | 28034 |
| 42525.0 | 28430 |
| 42507.0 | 28814 |
| 42492.0 | 29194 |
| 42466.0 | 29534 |
| 42441.0 | 29867 |
| 42411.0 | 30235 |
| 42385.0 | 30591 |
| 42384.0 | 30936 |
| 42372.0 | 31275 |
| 42324.0 | 31601 |
| 42500.0 | 32159 |
| 42608.0 | 32667 |
| 42512.0 | 32959 |
| 42392.0 | 33254 |
| 41764.0 | 32813 |
| 41518.0 | 33104 |
| 40830.0 | 33021 |
| 40669.0 | 33344 |
| 40730.0 | 33797 |
| 40864.0 | 33959 |
| 40932.0 | 34137 |
| 40922.0 | 34318 |
| 40859.0 | 34466 |
| 40693.0 | 34801 |
| 40506.0 | 35424 |
| 40335.0 | 35822 |
| 40119.0 | 36182 |
| 39867.0 | 36523 |
| 39581.0 | 36838 |
| 39308.0 | 37084 |
| 39037.0 | 37285 |
| 38761.0 | 37488 |
| 38446.0 | 37642 |
| 38148.0 | 37768 |
| 37834.0 | 37905 |
| 37503.0 | 38042 |
| 37179.0 | 38148 |
| 36858.0 | 38264 |
| 36536.0 | 38370 |
| 36197.0 | 38421 |
| 36197.0 | 38421 |
| 36197.0 | 38421 |
| 36197.0 | 38421 |
| 35534.0 | 38472 |
| 35534.0 | 38472 |
| 35534.0 | 38472 |
| 34787.0 | 38498 |
| 34195.0 | 38469 |
| 33655.0 | 38498 |
| 33216.0 | 38506 |
| 33216.0 | 38506 |
| 32689.0 | 38500 |
| 32235.0 | 38481 |
| 31774.0 | 38565 |
| 31328.0 | 38609 |
| 31025.0 | 38527 |
| 30627.0 | 38470 |
| 30115.0 | 38429 |
| 29684.0 | 38543 |
| 29684.0 | 38543 |
| 29214.0 | 38478 |
| 29214.0 | 38478 |
| 28666.0 | 38469 |
| 28154.0 | 38439 |
| 27710.0 | 38483 |
| 27231.0 | 38456 |
| 26853.0 | 38504 |
| 26465.0 | 38516 |
| 26091.0 | 38502 |
| 25736.0 | 38480 |
| 25736.0 | 38480 |
| 25736.0 | 38480 |
| 24966.0 | 37832 |
| 24476.0 | 37909 |
| 24020.0 | 37971 |
| 23599.0 | 38047 |
| 23185.0 | 38063 |
| 22866.0 | 38076 |
| 22522.0 | 38062 |
| 22184.0 | 38023 |
| 21840.0 | 37987 |
| 21433.0 | 37983 |
| 21063.0 | 37936 |
| 20680.0 | 37918 |
| 20295.0 | 37915 |
| 19882.0 | 37940 |
| 19400.0 | 38003 |
| 19121.0 | 38006 |
| 18726.0 | 37992 |
| 18453.0 | 37969 |
| 18190.0 | 37931 |
| 17866.0 | 37970 |
| 17515.0 | 38050 |
| 17181.0 | 38141 |
| 16844.0 | 38264 |
| 16540.0 | 38453 |
| 16234.0 | 38610 |
| 15906.0 | 38807 |
| 15634.0 | 38973 |
| 15400.0 | 39166 |
| 15155.0 | 39421 |
| 14936.0 | 39624 |
| 14739.0 | 39801 |
| 14560.0 | 40083 |
| 14415.0 | 40381 |
| 14415.0 | 40381 |
| 14231.0 | 40667 |
| 14073.0 | 41036 |
| 13936.0 | 41409 |
| 13817.0 | 41772 |
| 13697.0 | 42004 |
| 13628.0 | 42276 |
| 13526.0 | 42551 |
| 13448.0 | 42849 |
| 13420.0 | 43192 |
| 13394.0 | 43538 |
| 13426.0 | 43910 |
| 13447.0 | 44258 |
| 13348.0 | 44585 |
| 13277.0 | 44854 |
| 13243.0 | 45184 |
| 13340.0 | 45680 |
| 13340.0 | 45680 |
| 13096.0 | 46457 |
| 13096.0 | 46457 |
| 12838.0 | 47187 |
| 12905.0 | 47781 |
| 12944.0 | 48315 |
| 12784.0 | 48777 |
| 12679.0 | 49261 |
| 12757.0 | 49698 |
| 12757.0 | 49698 |
| 12571.0 | 50137 |
| 12494.0 | 50550 |
| 12435.0 | 50959 |
| 12369.0 | 51327 |
| 12263.0 | 51678 |
| 12279.0 | 52091 |
| 12647.0 | 52481 |
| 12901.0 | 52850 |
| 12701.0 | 53224 |
| 12540.0 | 53594 |
| 12429.0 | 53904 |
| 12366.0 | 54224 |
| 12322.0 | 54548 |
| 12418.0 | 54859 |
| 12473.0 | 55261 |
| 12511.0 | 55681 |
| 12495.0 | 55996 |
| 12620.0 | 56426 |
| 12620.0 | 56426 |
| 12620.0 | 56426 |
| 12504.0 | 56783 |
| 12456.0 | 57158 |
| 12456.0 | 57158 |
| 12436.0 | 57614 |
| 12463.0 | 58068 |
| 12463.0 | 58448 |
| 12333.0 | 58680 |
| 12261.0 | 58952 |
| 12261.0 | 58952 |
| 12261.0 | 58952 |
| 12470.0 | 59574 |
| 12647.0 | 60130 |
| 12798.0 | 60654 |
| 12976.0 | 61129 |
| 13021.0 | 61599 |
| 13032.0 | 62009 |
| 13056.0 | 62403 |
| 13093.0 | 62768 |
| 13164.0 | 63153 |
| 13237.0 | 63457 |
| 13298.0 | 63869 |
| 13389.0 | 64220 |
| 13491.0 | 64568 |
| 13596.0 | 64905 |
| 13671.0 | 65251 |
| 13733.0 | 65596 |
| 13819.0 | 65920 |
| 13898.0 | 66290 |
| 13969.0 | 66680 |
| 14044.0 | 67056 |
| 13867.0 | 67373 |
| 14053.0 | 67763 |
| 14107.0 | 68078 |
| 14175.0 | 68442 |
| 14232.0 | 68824 |
| 14290.0 | 69193 |
| 14338.0 | 69569 |
| 14399.0 | 69899 |
| 14496.0 | 70198 |
| 14594.0 | 70521 |
| 14736.0 | 70825 |
| 14831.0 | 71123 |
| 14921.0 | 71435 |
| 15022.0 | 71766 |
| 15131.0 | 72098 |
| 15403.0 | 72406 |
| 15517.0 | 72684 |
| 15746.0 | 72989 |
| 15734.0 | 73436 |
| 15764.0 | 73688 |
| 15828.0 | 73916 |
| 15980.0 | 74146 |
| 15926.0 | 74527 |
| 16012.0 | 74717 |
| 16126.0 | 74913 |
| 16289.0 | 75152 |
| 16439.0 | 75355 |
| 16292.0 | 75753 |
| 16163.0 | 76038 |
| 16163.0 | 76038 |
| 16163.0 | 76038 |
| 16332.0 | 76085 |
| 16073.0 | 76386 |
| 15865.0 | 76574 |
| 15602.0 | 76740 |
| 15372.0 | 76851 |
| 15110.0 | 76936 |
| 14881.0 | 76969 |
| 14536.0 | 77099 |
| 14536.0 | 77099 |
| 14334.0 | 77006 |
| 14090.0 | 76861 |
| 13912.0 | 76706 |
| 13912.0 | 76706 |
| 13590.0 | 76313 |
| 13473.0 | 76088 |
| 13369.0 | 75865 |
| 13321.0 | 75601 |
| 13141.0 | 75487 |
| 13108.0 | 75208 |
| 13084.0 | 74952 |
| 12719.0 | 74681 |
| 12810.0 | 74409 |
| 12878.0 | 74125 |
| 12898.0 | 73823 |
| 12823.0 | 73634 |
| 12786.0 | 73401 |
| 12992.0 | 73050 |
| 13119.0 | 72714 |
| 13208.0 | 72353 |
| 13280.0 | 72015 |
| 13094.0 | 71750 |
| 12985.0 | 71468 |
| 12930.0 | 71143 |
| 12969.0 | 70746 |
| 12912.0 | 70440 |
| 12871.0 | 70089 |
| 12852.0 | 69740 |
| 12826.0 | 69411 |
| 12819.0 | 69053 |
| 12793.0 | 68713 |
| 12744.0 | 68401 |
| 12698.0 | 68083 |
| 12615.0 | 67668 |
| 12632.0 | 67199 |
| 12654.0 | 66748 |
| 12513.0 | 66328 |
| 12441.0 | 65942 |
| 12374.0 | 65624 |
| 12322.0 | 65320 |
| 12322.0 | 65320 |
| 12308.0 | 64896 |
| 12395.0 | 64580 |
| 12354.0 | 64204 |
| 12354.0 | 64204 |
| 12345.0 | 63830 |
| 12311.0 | 63394 |
| 12245.0 | 62964 |
| 12245.0 | 62964 |
| 12182.0 | 62502 |
| 12113.0 | 62057 |
| 12037.0 | 61637 |
| 11950.0 | 61225 |
| 11863.0 | 60873 |
| 11688.0 | 60428 |
| 11651.0 | 60082 |
| 11651.0 | 60082 |
| 11583.0 | 59627 |
| 11379.0 | 59093 |
| 11425.0 | 58769 |
| 11421.0 | 58429 |
| 11417.0 | 58091 |
| 11401.0 | 57744 |
| 11391.0 | 57435 |
| 11424.0 | 57175 |
| 11389.0 | 56841 |
| 11372.0 | 56535 |
| 11325.0 | 56179 |
| 11358.0 | 55916 |
| 11401.0 | 55600 |
| 11425.0 | 55367 |
| 11466.0 | 55112 |
| 11410.0 | 54816 |
| 11342.0 | 54488 |
| 11423.0 | 54180 |
| 11517.0 | 53893 |
| 11569.0 | 53606 |
| 11589.0 | 53300 |
| 11624.0 | 52993 |
| 11576.0 | 52626 |
| 11689.0 | 52388 |
| 11632.0 | 52027 |
| 11623.0 | 51542 |
| 11518.0 | 51265 |
| 11518.0 | 51265 |
| 11518.0 | 51265 |
| 11622.0 | 50542 |
| 11713.0 | 49902 |
| 11754.0 | 49396 |
| 11826.0 | 48934 |
| 11862.0 | 48454 |
| 11877.0 | 48006 |
| 11871.0 | 47577 |
| 11812.0 | 47191 |
| 11796.0 | 46783 |
| 11790.0 | 46408 |
| 11780.0 | 45909 |
| 11752.0 | 45569 |
| 11752.0 | 45569 |
| 11733.0 | 45169 |
| 11720.0 | 44808 |
| 11728.0 | 44492 |
| 11738.0 | 44061 |
| 11771.0 | 43670 |
| 11819.0 | 43387 |
| 11864.0 | 43009 |
| 11907.0 | 42657 |
| 12006.0 | 42330 |
| 12118.0 | 41957 |
| 12234.0 | 41615 |
| 12311.0 | 41237 |
| 12410.0 | 40898 |
| 12512.0 | 40591 |
| 12668.0 | 40322 |
| 12751.0 | 40011 |
| 12941.0 | 39650 |
| 13077.0 | 39334 |
| 13089.0 | 39131 |
| 13187.0 | 38733 |
| 13187.0 | 38733 |
| 13283.0 | 38215 |
| 13285.0 | 37896 |
| 13195.0 | 37599 |
| 13107.0 | 37309 |
| 13050.0 | 36949 |
| 12861.0 | 36719 |
| 12687.0 | 36429 |
| 12487.0 | 36192 |
| 12249.0 | 35923 |
| 12210.0 | 35546 |
| 11973.0 | 35313 |
| 11667.0 | 35141 |
| 11391.0 | 34962 |
| 11068.0 | 34813 |
| 10739.0 | 34670 |
| 10392.0 | 34529 |
| 10171.0 | 34383 |
| 9865.0 | 34245 |
| 9581.0 | 34111 |
| 9293.0 | 33985 |
| 9075.0 | 33860 |
| 8845.0 | 33716 |
| 8514.0 | 33580 |
| 8237.0 | 33429 |
| 7919.0 | 33279 |
| 7680.0 | 33120 |
| 7456.0 | 32922 |
| 7199.0 | 32750 |
| 6965.0 | 32553 |
| 6906.0 | 32164 |
| 6667.0 | 31987 |
| 6579.0 | 31730 |
| 6844.0 | 31139 |
| 6660.0 | 30927 |
| 6606.0 | 30670 |
| 6370.0 | 30544 |
| 6204.0 | 30202 |
| 6112.0 | 29819 |
| 6051.0 | 29577 |
| 6020.0 | 29426 |
| 5888.0 | 29272 |
| 5858.0 | 29068 |
| 5970.0 | 28849 |
| 6003.0 | 28665 |
| 6003.0 | 28665 |
| 6126.0 | 28373 |
| 6249.0 | 28119 |
| 6372.0 | 27873 |
| 6489.0 | 27626 |
| 6666.0 | 27394 |
| 6836.0 | 27232 |
| 6950.0 | 27089 |
| 6950.0 | 27089 |
| 7270.0 | 26853 |
| 7496.0 | 26722 |
| 7847.0 | 26622 |
| 7847.0 | 26622 |
| 8255.0 | 26523 |
| 8255.0 | 26523 |
| 8693.0 | 26381 |
| 9126.0 | 26236 |
| 9528.0 | 26119 |
| 9909.0 | 26026 |
| 10278.0 | 25960 |
| 10632.0 | 25921 |
| 10971.0 | 25945 |
| 11340.0 | 25948 |
| 11682.0 | 25972 |
| 12021.0 | 26014 |
| 12331.0 | 26064 |
| 12681.0 | 26041 |
| 13012.0 | 26175 |
| 13364.0 | 26124 |
| 13815.0 | 26085 |
| 14260.0 | 25935 |
| 14668.0 | 25788 |
| 15082.0 | 25728 |
| 15399.0 | 26668 |
| 15709.0 | 26552 |
| 16016.0 | 26581 |
| 16324.0 | 26583 |
| 16656.0 | 26570 |
| 16967.0 | 26695 |
| 17453.0 | 26846 |
| 17959.0 | 27120 |
| 18400.0 | 27309 |
| 18693.0 | 27351 |
| 18947.0 | 27402 |
| 19244.0 | 27450 |
| 19555.0 | 27522 |
| 19860.0 | 27602 |
| 20165.0 | 27661 |
| 20453.0 | 27656 |
| 20729.0 | 27666 |
| 20973.0 | 27730 |
| 21313.0 | 27790 |
| 21538.0 | 27741 |
| 21911.0 | 27876 |
| 22226.0 | 27845 |
| 22565.0 | 28039 |
| 22907.0 | 28188 |
| 23184.0 | 28377 |
| 23507.0 | 28261 |
| 23796.0 | 28378 |
| 24049.0 | 28549 |
| 24278.0 | 28697 |
| 24518.0 | 28783 |
| 24717.0 | 28948 |
| 24886.0 | 29137 |
| 24959.0 | 29116 |
| 25052.0 | 29154 |
| 25137.0 | 29259 |
| 25211.0 | 29409 |
| 25265.0 | 29557 |
| 25409.0 | 30022 |
| 25395.0 | 30059 |
| 25497.0 | 30554 |
| 25410.0 | 30563 |
| 25498.0 | 31111 |
| 25341.0 | 31074 |
| 25219.0 | 31466 |
| 25097.0 | 31765 |
| 24957.0 | 32049 |
| 24817.0 | 32319 |
| 24659.0 | 32571 |
| 24466.0 | 32808 |
| 24201.0 | 32930 |
| 23981.0 | 33018 |
| 23767.0 | 33124 |
| 23559.0 | 33197 |
| 23362.0 | 33373 |
| 23072.0 | 33377 |
| 23056.0 | 33662 |
| 23011.0 | 33982 |
| 22901.0 | 34220 |
| 22732.0 | 34382 |
| 22564.0 | 34502 |
| 22366.0 | 34597 |
| 21794.0 | 34226 |
| 21403.0 | 34023 |
| 21033.0 | 33870 |
| 20674.0 | 33765 |
| 20299.0 | 33677 |
| 19929.0 | 33619 |
| 19541.0 | 33572 |
| 19135.0 | 33560 |
| 18825.0 | 33521 |
| 18513.0 | 33522 |
| 18257.0 | 33489 |
| 18006.0 | 33489 |
| 17713.0 | 33498 |
| 17465.0 | 33505 |
| 17250.0 | 33516 |
| 17002.0 | 33543 |
| 16785.0 | 33557 |
| 16528.0 | 33626 |
| 16290.0 | 33736 |
| 16082.0 | 33758 |
| 15890.0 | 33903 |
| 15620.0 | 33983 |
| 15431.0 | 34146 |
| 15237.0 | 34296 |
| 15058.0 | 34466 |
| 14923.0 | 34651 |
| 14793.0 | 34856 |
| 14793.0 | 34856 |
| 14708.0 | 35123 |
| 14600.0 | 35386 |
| 14511.0 | 35650 |
| 14462.0 | 35927 |
| 14491.0 | 36209 |
| 14532.0 | 36481 |
| 14647.0 | 36692 |
| 14665.0 | 36987 |
| 14817.0 | 37216 |
| 14945.0 | 37477 |
| 15080.0 | 37705 |
| 15231.0 | 37901 |
| 15514.0 | 37975 |
| 15784.0 | 37994 |
| 15983.0 | 38072 |
| 16188.0 | 38195 |
| 16402.0 | 38274 |
| 16620.0 | 38333 |
| 16872.0 | 38382 |
| 17155.0 | 38423 |
| 17417.0 | 38454 |
| 17674.0 | 38493 |
| 17979.0 | 38504 |
| 18289.0 | 38524 |
| 18560.0 | 38532 |
| 18826.0 | 38561 |
| 19118.0 | 38565 |
| 19475.0 | 38581 |
| 19849.0 | 38549 |
| 20210.0 | 38539 |
| 20508.0 | 38577 |
| 20748.0 | 38662 |
| 21114.0 | 38708 |
| 21463.0 | 38659 |
| 21463.0 | 38659 |
| 21916.0 | 38716 |
| 21916.0 | 38716 |
| 22435.0 | 38732 |
| 22922.0 | 38476 |
| 23367.0 | 38460 |
| 23805.0 | 38432 |
| 24229.0 | 38409 |
| 24628.0 | 38361 |
| 25019.0 | 38347 |
| 25412.0 | 38335 |
| 25806.0 | 38335 |
| 26184.0 | 38377 |
| 26556.0 | 38293 |
| 26927.0 | 38244 |
| 27297.0 | 38257 |
| 27645.0 | 38263 |
| 27853.0 | 38147 |
| 28199.0 | 38161 |
| 28611.0 | 38239 |
| 28964.0 | 38281 |
| 29267.0 | 38247 |
| 29585.0 | 38229 |
| 29948.0 | 38217 |
| 30347.0 | 38240 |
| 30685.0 | 38246 |
| 30685.0 | 38246 |
| 31154.0 | 38233 |
| 31154.0 | 38233 |
| 31693.0 | 38195 |
| 32161.0 | 38243 |
| 32689.0 | 37779 |
| 33037.0 | 37739 |
| 33037.0 | 37739 |
| 33337.0 | 37701 |
| 33831.0 | 37815 |
| 34363.0 | 37925 |
| 34813.0 | 38018 |
| 35160.0 | 38063 |
| 35494.0 | 38092 |
| 35796.0 | 38092 |
| 36088.0 | 38092 |
| 36407.0 | 38091 |
| 36727.0 | 38110 |
| 37013.0 | 38147 |
| 37265.0 | 38193 |
| 37384.0 | 38151 |
| 37482.0 | 38197 |
| 37665.0 | 38233 |
| 37963.0 | 38220 |
| 38240.0 | 38252 |
| 38473.0 | 38307 |
| 38685.0 | 38370 |
| 39040.0 | 38573 |
| 39350.0 | 38739 |
| 39610.0 | 38917 |
| 39835.0 | 39134 |
| 40089.0 | 39411 |
| 40337.0 | 39681 |
| 40449.0 | 39996 |
| 40643.0 | 40150 |
| 40801.0 | 40368 |
| 40928.0 | 40590 |
| 41051.0 | 40835 |
| 41163.0 | 41105 |
| 41251.0 | 41402 |
| 41327.0 | 41693 |
| 41396.0 | 41957 |
| 41434.0 | 42267 |
| 41469.0 | 42575 |
| 41521.0 | 42915 |
| 41581.0 | 43286 |
| 41646.0 | 43659 |
| 41668.0 | 43918 |
| 41703.0 | 44389 |
| 41703.0 | 44389 |
| 41783.0 | 44742 |
| 41828.0 | 45208 |
| 41884.0 | 45554 |
| 42017.0 | 45851 |
| 41958.0 | 46327 |
| 41917.0 | 46756 |
| 42057.0 | 46962 |
| 42148.0 | 47204 |
| 42220.0 | 47450 |
| 42221.0 | 47753 |
| 42277.0 | 48156 |
| 42294.0 | 48600 |
| 42215.0 | 49036 |
| 42156.0 | 49453 |
| 42112.0 | 49848 |
| 42071.0 | 50232 |
| 42033.0 | 50609 |
| 41997.0 | 50950 |
| 41945.0 | 51294 |
| 41920.0 | 51642 |
| 41890.0 | 51988 |
| 41523.0 | 51958 |
| 41787.0 | 52473 |
| 41814.0 | 52783 |
| 41722.0 | 53157 |
| 41634.0 | 53357 |
| 41616.0 | 53860 |
| 41616.0 | 53860 |
| 41616.0 | 53860 |
| 41626.0 | 54527 |
| 41620.0 | 55134 |
| 41649.0 | 55636 |
| 41784.0 | 56047 |
| 41908.0 | 56444 |
| 41908.0 | 56444 |
| 41908.0 | 56444 |
| 41936.0 | 57102 |
| 40398.0 | 59040 |
| 40398.0 | 59040 |
| 40398.0 | 59040 |
| 40398.0 | 59040 |
| 40726.0 | 59374 |
| 41077.0 | 59806 |
| 41238.0 | 60210 |
| 41424.0 | 60600 |
| 41573.0 | 60975 |
| 41723.0 | 61345 |
| 41795.0 | 61735 |
| 41795.0 | 61735 |
| 41859.0 | 62183 |
| 40952.0 | 63449 |
| 41136.0 | 63628 |
| 41295.0 | 63900 |
| 41475.0 | 64073 |
| 41873.0 | 64057 |
| 41873.0 | 64057 |
| 41817.0 | 64562 |
| 41817.0 | 64562 |
| 41953.0 | 65107 |
| 41775.0 | 65628 |
| 41669.0 | 66097 |
| 41551.0 | 66521 |
| 41971.0 | 66896 |
| 41843.0 | 67246 |
| 41482.0 | 67563 |
| 41862.0 | 67893 |
| 41784.0 | 68214 |
| 41724.0 | 68522 |
| 41671.0 | 68836 |
| 41661.0 | 69131 |
| 41647.0 | 69429 |
| 41715.0 | 69722 |
| 41751.0 | 70012 |
| 41827.0 | 70300 |
| 41909.0 | 70559 |
| 42040.0 | 70817 |
| 42164.0 | 71087 |
| 42266.0 | 71309 |
| 42369.0 | 71530 |
| 42524.0 | 71755 |
| 42695.0 | 71948 |
| 42858.0 | 72170 |
| 43004.0 | 72404 |
| 43165.0 | 72617 |
| 43356.0 | 72833 |
| 43576.0 | 73029 |
| 43793.0 | 73232 |
| 44033.0 | 73417 |
| 44276.0 | 73599 |
| 44516.0 | 73776 |
| 44772.0 | 73953 |
| 45018.0 | 74118 |
| 45273.0 | 74268 |
| 45523.0 | 74395 |
| 45801.0 | 74494 |
| 46104.0 | 74593 |
| 46380.0 | 74670 |
| 46656.0 | 74721 |
| 46836.0 | 74763 |
| 47131.0 | 74829 |
| 47234.0 | 74909 |
| 47516.0 | 74907 |
| 47779.0 | 74918 |
| 48140.0 | 74921 |
| 48448.0 | 74968 |
| 48448.0 | 74968 |
| 48934.0 | 75145 |
| 49339.0 | 75199 |
| 49339.0 | 75199 |
| 49339.0 | 75199 |
| 49339.0 | 75199 |
| 49339.0 | 75199 |
| 49339.0 | 75199 |
| 50003.0 | 75375 |
| 50003.0 | 75375 |
| 50003.0 | 75375 |
| 50003.0 | 75375 |
| 50623.0 | 75247 |
| 50623.0 | 75247 |
| 50623.0 | 75247 |
| 50623.0 | 75247 |
| 50623.0 | 75247 |
| 50623.0 | 75247 |
| 50992.0 | 74872 |
| 51269.0 | 74641 |
| 51434.0 | 74446 |
| 51673.0 | 74680 |
| 51876.0 | 74954 |
| 51947.0 | 75387 |
| 51987.0 | 75883 |
| 51960.0 | 76168 |
| 51932.0 | 76529 |
| 51865.0 | 76777 |
| 51786.0 | 76943 |
| 51661.0 | 77063 |
| 51490.0 | 77168 |
| 51283.0 | 77230 |
| 51059.0 | 77345 |
| 50729.0 | 77433 |
| 50467.0 | 77468 |
| 50202.0 | 77542 |
| 49920.0 | 77585 |
| 49613.0 | 77617 |
| 49344.0 | 77644 |
| 49051.0 | 77681 |
| 48702.0 | 77669 |
| 48364.0 | 77679 |
| 48010.0 | 77669 |
| 47646.0 | 77623 |
| 47272.0 | 77557 |
| 46919.0 | 77514 |
| 46579.0 | 77493 |
| 46225.0 | 77403 |
| 45918.0 | 77266 |
| 45611.0 | 77174 |
| 45335.0 | 77117 |
| 44880.0 | 77051 |
| 44450.0 | 76923 |
| 44061.0 | 76805 |
| 43694.0 | 76679 |
| 43344.0 | 76496 |
| 43016.0 | 76343 |
| 42788.0 | 76172 |
| 42730.0 | 75932 |
| 42635.0 | 75707 |
| 42327.0 | 75500 |
| 42198.0 | 75281 |
| 42080.0 | 75056 |
| 42080.0 | 75056 |
| 42080.0 | 75056 |
| 41908.0 | 74698 |
| 41738.0 | 74338 |
| 41369.0 | 73970 |
| 41369.0 | 73970 |
| 41118.0 | 73496 |
| 40950.0 | 73070 |
| 41005.0 | 72655 |
| 41107.0 | 72262 |
| 41115.0 | 71882 |
| 41796.0 | 71231 |
| 41514.0 | 70912 |
| 41600.0 | 70576 |
| 41637.0 | 70259 |
| 41345.0 | 69929 |
| 41289.0 | 69594 |
| 41152.0 | 69296 |
| 41011.0 | 69009 |
| 41009.0 | 68677 |
| 41027.0 | 68343 |
| 41084.0 | 67966 |
| 41129.0 | 67593 |
| 41328.0 | 67091 |
| 41360.0 | 66727 |
| 41544.0 | 66261 |
| 41588.0 | 65874 |
| 41592.0 | 65571 |
| 41616.0 | 65260 |
| 41643.0 | 64933 |
| 41713.0 | 64544 |
| 41406.0 | 64156 |
| 41515.0 | 63802 |
| 41564.0 | 63421 |
| 41564.0 | 63421 |
| 41583.0 | 62980 |
| 41583.0 | 62980 |
| 41591.0 | 62463 |
| 41591.0 | 62463 |
| 41591.0 | 62463 |
| 41591.0 | 62463 |
| 41591.0 | 62463 |
| 41591.0 | 62463 |
| 41591.0 | 62463 |
| 41591.0 | 62463 |
| 41591.0 | 62463 |
| 41591.0 | 62463 |
| 41846.0 | 61169 |
| 41840.0 | 60215 |
| 41796.0 | 59403 |
| 41791.0 | 58656 |
| 41789.0 | 58036 |
| 41765.0 | 57450 |
| 41713.0 | 56931 |
| 41687.0 | 56460 |
| 41582.0 | 56081 |
| 41582.0 | 56081 |
| 41603.0 | 55528 |
| 41484.0 | 55186 |
| 41484.0 | 55186 |
| 41417.0 | 54665 |
| 41323.0 | 54124 |
| 41272.0 | 53646 |
| 41204.0 | 53174 |
| 41181.0 | 52764 |
| 41226.0 | 52427 |
| 41253.0 | 52068 |
| 41249.0 | 51667 |
| 41233.0 | 51272 |
| 41225.0 | 50904 |
| 41203.0 | 50522 |
| 41138.0 | 50118 |
| 41144.0 | 49791 |
| 41212.0 | 49471 |
| 41270.0 | 49162 |
| 41314.0 | 48839 |
| 41353.0 | 48532 |
| 41416.0 | 48182 |
| 41501.0 | 47827 |
| 41495.0 | 47548 |
| 41499.0 | 47219 |
| 41479.0 | 46921 |
| 41413.0 | 46456 |
| 41417.0 | 46077 |
| 41432.0 | 45645 |
| 41470.0 | 45280 |
| 41499.0 | 44932 |
| 41533.0 | 44565 |
| 41537.0 | 44195 |
| 41557.0 | 43821 |
| 41572.0 | 43398 |
| 41631.0 | 43034 |
| 41673.0 | 42702 |
| 41621.0 | 42408 |
| 41529.0 | 42141 |
| 41477.0 | 41849 |
| 41503.0 | 41486 |
| 41477.0 | 41103 |
| 41515.0 | 40691 |
| 41530.0 | 40326 |
| 41536.0 | 39978 |
| 41548.0 | 39638 |
| 41551.0 | 39287 |
| 41555.0 | 38921 |
| 41545.0 | 38585 |
| 41459.0 | 38298 |
| 41410.0 | 37976 |
| 41433.0 | 37581 |
| 41428.0 | 37197 |
| 41505.0 | 36779 |
| 41505.0 | 36779 |
| 41053.0 | 36734 |
| 41212.0 | 36172 |
| 40716.0 | 36186 |
| 40410.0 | 36017 |
| 40037.0 | 35951 |
| 39812.0 | 35772 |
| 39805.0 | 35411 |
| 40083.0 | 34798 |
| 40380.0 | 34188 |
| 40470.0 | 33524 |
| 40657.0 | 33083 |
| 40770.0 | 32648 |
| 40811.0 | 32232 |
| 40839.0 | 31796 |
| 40854.0 | 31373 |
| 40873.0 | 30973 |
| 40939.0 | 30627 |
| 40983.0 | 30357 |
| 41024.0 | 30042 |
| 41052.0 | 29713 |
| 41078.0 | 29367 |
| 41074.0 | 29043 |
| 41060.0 | 28699 |
| 41018.0 | 28330 |
| 40986.0 | 27944 |
| 40918.0 | 27556 |
| 40921.0 | 27203 |
| 40884.0 | 26871 |
| 41093.0 | 26271 |
| 41203.0 | 25772 |
| 41287.0 | 25309 |
| 41412.0 | 24831 |
| 41503.0 | 24375 |
| 41428.0 | 24243 |
| 41339.0 | 23971 |
| 41270.0 | 23624 |
| 41210.0 | 23228 |
| 41168.0 | 22845 |
| 41160.0 | 22672 |
| 41149.0 | 22317 |
| 41154.0 | 21938 |
| 41122.0 | 21695 |
| 41068.0 | 21366 |
| 40997.0 | 21049 |
| 41029.0 | 20711 |
| 41026.0 | 20325 |
| 41027.0 | 19980 |
| 41013.0 | 19623 |
| 40976.0 | 19249 |
| 40903.0 | 18959 |
| 40739.0 | 18733 |
| 40759.0 | 18332 |
| 40709.0 | 18005 |
| 40729.0 | 17603 |
| 40749.0 | 17197 |
| 40805.0 | 16438 |
| 40839.0 | 16166 |
| 40865.0 | 15868 |
| 40903.0 | 15515 |
| 40851.0 | 15167 |
| 40719.0 | 14899 |
| 40699.0 | 14738 |
| 41563.0 | 14414 |
| 41365.0 | 13930 |
| 41215.0 | 13522 |
| 40925.0 | 13011 |
| 40894.0 | 12669 |
| 40860.0 | 12321 |
| 40688.0 | 11846 |
| 40714.0 | 11554 |
| 40757.0 | 11274 |
| 40762.0 | 10965 |
| 40720.0 | 10642 |
| 40696.0 | 10349 |
| 40668.0 | 10081 |
| 40688.0 | 9850 |
| 40661.0 | 9605 |
| 40588.0 | 9348 |
| 40629.0 | 9185 |
| 40676.0 | 9021 |
| 40717.0 | 8837 |
| 40732.0 | 8639 |
| 40734.0 | 8430 |
| 40691.0 | 8175 |
| 40621.0 | 7899 |
| 40577.0 | 7647 |
| 40554.0 | 7433 |
| 40556.0 | 7238 |
| 40576.0 | 7068 |
| 40603.0 | 6885 |
| 40650.0 | 6721 |
| 40573.0 | 6514 |
| 40591.0 | 6343 |
| 40532.0 | 6080 |
| 40562.0 | 5942 |
| 40579.0 | 5804 |
| 40584.0 | 5635 |
| 40575.0 | 5438 |
| 40601.0 | 5249 |
| 40589.0 | 5093 |
| 40650.0 | 4945 |
| 40762.0 | 4761 |
| 40817.0 | 4606 |
| 40883.0 | 4514 |
| 40921.0 | 4444 |
| 41049.0 | 4310 |
| 41180.0 | 4163 |
| 41267.0 | 4091 |
| 41311.0 | 4084 |
| 41367.0 | 4071 |
| 41452.0 | 4090 |
| 41480.0 | 4087 |
| 41656.0 | 4076 |
| 41807.0 | 4110 |
| 41934.0 | 4181 |
| 42101.0 | 4251 |
| 42285.0 | 4334 |
| 42435.0 | 4436 |
| 42567.0 | 4568 |
| 42628.0 | 4697 |
| 42705.0 | 4880 |
| 42791.0 | 5081 |
| 42862.0 | 5299 |
| 42832.0 | 5477 |
| 42896.0 | 5711 |
| 42943.0 | 5943 |
| 42949.0 | 6133 |
| 42957.0 | 6407 |
| 42966.0 | 6676 |
| 42959.0 | 6939 |
| 42941.0 | 7207 |
| 42924.0 | 7468 |
| 42931.0 | 7754 |
| 42730.0 | 8093 |
| 42763.0 | 8350 |
| 42778.0 | 8616 |
| 42788.0 | 8894 |
| 42794.0 | 9196 |
| 42729.0 | 9459 |
| 42712.0 | 9769 |
| 42664.0 | 10112 |
| 42640.0 | 10458 |
| 42599.0 | 10801 |
| 42539.0 | 11132 |
| 42499.0 | 11432 |
| 42531.0 | 11785 |
| 42527.0 | 12132 |
| 42488.0 | 12486 |
| 42414.0 | 12821 |
| 42368.0 | 13141 |
| 42336.0 | 13469 |
| 42302.0 | 13898 |
| 42257.0 | 14248 |
| 42180.0 | 14589 |
| 42181.0 | 14673 |
| 42122.0 | 15079 |
| 42072.0 | 15525 |
| 42041.0 | 15953 |
| 42026.0 | 16376 |
| 42026.0 | 16766 |
| 42060.0 | 17166 |
| 42082.0 | 17574 |
| 42128.0 | 17981 |
| 42148.0 | 18392 |
| 42170.0 | 18782 |
| 42222.0 | 19194 |
| 42214.0 | 19553 |
| 42206.0 | 19877 |
| 42192.0 | 20200 |
| 42178.0 | 20530 |
| 42174.0 | 20876 |
| 42187.0 | 21267 |
| 42175.0 | 21645 |
| 42168.0 | 22000 |
| 42144.0 | 22323 |
| 42118.0 | 22652 |
| 42139.0 | 22980 |
| 42180.0 | 23381 |
| 42156.0 | 23679 |
| 42183.0 | 24034 |
| 42219.0 | 24455 |
| 42205.0 | 24814 |
| 42224.0 | 25153 |
| 42269.0 | 25485 |
| 42318.0 | 25857 |
| 42329.0 | 26218 |
| 42424.0 | 26520 |
| 42397.0 | 26821 |
| 42464.0 | 27091 |
| 42436.0 | 27411 |
| 42446.0 | 27845 |
| 42462.0 | 28280 |
| 42473.0 | 28681 |
| 42485.0 | 29050 |
| 42526.0 | 29389 |
| 42559.0 | 29720 |
| 42572.0 | 30050 |
| 42576.0 | 30401 |
| 42591.0 | 30742 |
| 42601.0 | 31080 |
| 42604.0 | 31420 |
| 42711.0 | 31859 |
| 42742.0 | 32204 |
| 42770.0 | 32555 |
| 42639.0 | 32771 |
| 42804.0 | 33257 |
| 42156.0 | 32757 |
| 41510.0 | 32321 |
| 41649.0 | 32964 |
| 41420.0 | 33239 |
| 41265.0 | 33826 |
| 41482.0 | 34069 |
| 41591.0 | 34342 |
| 41636.0 | 34605 |
| 41629.0 | 34847 |
| 41571.0 | 35435 |
| 41487.0 | 35871 |
| 41372.0 | 36274 |
| 41282.0 | 36584 |
| 41123.0 | 36894 |
| 40943.0 | 37182 |
| 40737.0 | 37446 |
| 40541.0 | 37664 |
| 40310.0 | 37848 |
| 40068.0 | 38013 |
| 39801.0 | 38198 |
| 39514.0 | 38272 |
| 39211.0 | 38378 |
| 38915.0 | 38462 |
| 38594.0 | 38557 |
| 38260.0 | 38609 |
| 37928.0 | 38613 |
| 37583.0 | 38649 |
| 37264.0 | 38573 |
| 36924.0 | 38603 |
| 36577.0 | 38616 |
| 36253.0 | 38650 |
| 35909.0 | 38653 |
| 35526.0 | 38648 |
| 35160.0 | 38648 |
| 34832.0 | 38631 |
| 34509.0 | 38588 |
| 34202.0 | 38547 |
| 33892.0 | 38521 |
| 33526.0 | 38446 |
| 33158.0 | 38402 |
| 32823.0 | 38345 |
| 32823.0 | 38345 |
| 32395.0 | 38296 |
| 31944.0 | 38303 |
| 31944.0 | 38303 |
| 31472.0 | 38376 |
| 32114.0 | 37213 |
| 31597.0 | 37265 |
| 31597.0 | 37265 |
| 30823.0 | 37618 |
| 30130.0 | 37847 |
| 29608.0 | 37968 |
| 29110.0 | 38051 |
| 28604.0 | 38103 |
| 28098.0 | 38118 |
| 27561.0 | 38153 |
| 27131.0 | 38199 |
| 26733.0 | 38214 |
| 26376.0 | 38237 |
| 26023.0 | 38227 |
| 25680.0 | 38101 |
| 25318.0 | 38035 |
| 24974.0 | 38177 |
| 24589.0 | 38122 |
| 24252.0 | 38015 |
| 23922.0 | 37924 |
| 23579.0 | 37896 |
| 23579.0 | 37896 |
| 23157.0 | 37943 |
| 22772.0 | 37967 |
| 22391.0 | 37986 |
| 22015.0 | 38014 |
| 21674.0 | 38018 |
| 21355.0 | 38022 |
| 21047.0 | 37911 |
| 20699.0 | 37973 |
| 20400.0 | 37989 |
| 20132.0 | 38008 |
| 19825.0 | 38034 |
| 19530.0 | 38033 |
| 19257.0 | 38135 |
| 19006.0 | 38183 |
| 18782.0 | 38210 |
| 18543.0 | 38214 |
| 18322.0 | 38217 |
| 18062.0 | 38207 |
| 17795.0 | 38335 |
| 17512.0 | 38485 |
| 17245.0 | 38554 |
| 16988.0 | 38608 |
| 16988.0 | 38608 |
| 16652.0 | 38782 |
| 16333.0 | 38982 |
| 16047.0 | 39170 |
| 15817.0 | 39341 |
| 15593.0 | 39559 |
| 15370.0 | 39794 |
| 15168.0 | 40080 |
| 14989.0 | 40246 |
| 14989.0 | 40246 |
| 14819.0 | 40561 |
| 14641.0 | 40810 |
| 14492.0 | 41070 |
| 14362.0 | 41431 |
| 14234.0 | 41774 |
| 14132.0 | 42133 |
| 14047.0 | 42495 |
| 13969.0 | 42726 |
| 13876.0 | 43053 |
| 13816.0 | 43417 |
| 13788.0 | 43696 |
| 13740.0 | 43987 |
| 13736.0 | 44295 |
| 13736.0 | 44295 |
| 13736.0 | 44704 |
| 13627.0 | 44978 |
| 13644.0 | 45376 |
| 13644.0 | 45376 |
| 13268.0 | 46096 |
| 13268.0 | 46096 |
| 13334.0 | 46882 |
| 13398.0 | 47328 |
| 13369.0 | 47732 |
| 13369.0 | 47732 |
| 13290.0 | 48393 |
| 13299.0 | 48789 |
| 13259.0 | 49201 |
| 13259.0 | 49201 |
| 12964.0 | 49811 |
| 12787.0 | 50358 |
| 12942.0 | 50831 |
| 13046.0 | 51260 |
| 12960.0 | 51504 |
| 13181.0 | 52009 |
| 13128.0 | 52365 |
| 13056.0 | 52671 |
| 13071.0 | 52897 |
| 13086.0 | 53132 |
| 13040.0 | 53467 |
| 13016.0 | 53771 |
| 12952.0 | 54084 |
| 12817.0 | 54632 |
| 12762.0 | 55143 |
| 12779.0 | 55664 |
| 12729.0 | 56015 |
| 12740.0 | 56468 |
| 12661.0 | 56818 |
| 12661.0 | 56818 |
| 12630.0 | 57230 |
| 12679.0 | 57670 |
| 12798.0 | 58160 |
| 12798.0 | 58160 |
| 12682.0 | 58522 |
| 12682.0 | 58522 |
| 12682.0 | 58522 |
| 12599.0 | 59011 |
| 12606.0 | 59508 |
| 12417.0 | 59778 |
| 12417.0 | 59778 |
| 12531.0 | 60346 |
| 12699.0 | 60831 |
| 12822.0 | 61215 |
| 12814.0 | 61658 |
| 12901.0 | 62037 |
| 12962.0 | 62413 |
| 13017.0 | 62771 |
| 13028.0 | 63209 |
| 13093.0 | 63641 |
| 13190.0 | 64002 |
| 13269.0 | 64348 |
| 13348.0 | 64698 |
| 13428.0 | 65063 |
| 13523.0 | 65434 |
| 13609.0 | 65773 |
| 13671.0 | 66107 |
| 13769.0 | 66513 |
| 13737.0 | 66821 |
| 13899.0 | 67221 |
| 14052.0 | 67544 |
| 14133.0 | 67857 |
| 14221.0 | 68198 |
| 14308.0 | 68533 |
| 14002.0 | 68864 |
| 14159.0 | 69209 |
| 14232.0 | 69600 |
| 14366.0 | 69905 |
| 14484.0 | 70201 |
| 14604.0 | 70510 |
| 14479.0 | 70796 |
| 14672.0 | 71085 |
| 14859.0 | 71371 |
| 15163.0 | 71656 |
| 15420.0 | 71954 |
| 15459.0 | 72238 |
| 15185.0 | 72518 |
| 14924.0 | 72764 |
| 15161.0 | 72989 |
| 15268.0 | 73482 |
| 15328.0 | 73822 |
| 15459.0 | 73959 |
| 15562.0 | 74142 |
| 15764.0 | 74307 |
| 15807.0 | 74463 |
| 15928.0 | 74826 |
| 16026.0 | 74935 |
| 16026.0 | 74935 |
| 16190.0 | 75137 |
| 16289.0 | 75408 |
| 16289.0 | 75408 |
| 16437.0 | 75567 |
| 16293.0 | 75889 |
| 16293.0 | 75889 |
| 16142.0 | 76203 |
| 16167.0 | 76261 |
| 16077.0 | 76359 |
| 15892.0 | 76536 |
| 15626.0 | 76693 |
| 15462.0 | 76789 |
| 15228.0 | 76852 |
| 14981.0 | 76891 |
| 14791.0 | 76888 |
| 14604.0 | 76839 |
| 14388.0 | 76802 |
| 14380.0 | 76687 |
| 14148.0 | 76560 |
| 13774.0 | 76538 |
| 13631.0 | 76350 |
| 13338.0 | 76303 |
| 13109.0 | 76176 |
| 12712.0 | 76226 |
| 12653.0 | 75946 |
| 12776.0 | 75581 |
| 12876.0 | 75246 |
| 12927.0 | 74910 |
| 12934.0 | 74591 |
| 12903.0 | 74286 |
| 12909.0 | 73989 |
| 12960.0 | 73686 |
| 13054.0 | 73365 |
| 13136.0 | 73085 |
| 13199.0 | 72750 |
| 13264.0 | 72411 |
| 13285.0 | 72085 |
| 13132.0 | 71845 |
| 12973.0 | 71572 |
| 12900.0 | 71262 |
| 12824.0 | 70970 |
| 12792.0 | 70667 |
| 12740.0 | 70369 |
| 12667.0 | 70070 |
| 12637.0 | 69742 |
| 12638.0 | 69419 |
| 12663.0 | 69104 |
| 12652.0 | 68822 |
| 12630.0 | 68448 |
| 12612.0 | 68190 |
| 12659.0 | 67852 |
| 12605.0 | 67586 |
| 12586.0 | 67285 |
| 12494.0 | 66990 |
| 12512.0 | 66597 |
| 12463.0 | 66345 |
| 12437.0 | 66116 |
| 12408.0 | 65877 |
| 12371.0 | 65636 |
| 12305.0 | 65407 |
| 12244.0 | 65151 |
| 12187.0 | 64902 |
| 12127.0 | 64691 |
| 12050.0 | 64485 |
| 11965.0 | 64226 |
| 11867.0 | 64029 |
| 11807.0 | 63871 |
| 11722.0 | 63677 |
| 11652.0 | 63478 |
| 11589.0 | 63286 |
| 11589.0 | 63286 |
| 11467.0 | 63008 |
| 11424.0 | 62807 |
| 11390.0 | 62630 |
| 11325.0 | 62443 |
| 11267.0 | 62284 |
| 11206.0 | 62114 |
| 11141.0 | 61960 |
| 11082.0 | 61810 |
| 11050.0 | 61663 |
| 10996.0 | 61502 |
| 10958.0 | 61380 |
| 10912.0 | 61248 |
| 10876.0 | 61138 |
| 10831.0 | 61023 |
| 10822.0 | 60963 |
| 10794.0 | 60884 |
| 10780.0 | 60817 |
| 10761.0 | 60754 |
| 10745.0 | 60707 |
| 10720.0 | 60659 |
| 10689.0 | 60604 |
| 10667.0 | 60567 |
| 10662.0 | 60529 |
| 10665.0 | 60513 |
| 10645.0 | 60492 |
| 10642.0 | 60492 |
| 10653.0 | 60489 |
| 10643.0 | 60464 |
| 10641.0 | 60458 |
| 10635.0 | 60454 |
| 10633.0 | 60446 |
| 10647.0 | 60452 |
| 10650.0 | 60460 |
| 10644.0 | 60451 |
| 10633.0 | 60451 |
| 10639.0 | 60458 |
| 10652.0 | 60450 |
| 10651.0 | 60449 |
| 10649.0 | 60450 |
| 0.0 | 0 |
| 0.0 | 0 |
| 0.0 | 0 |
| 0.0 | 0 |
| 0.0 | 0 |
| 0.0 | 0 |
| 0.0 | 0 |
| 0.0 | 0 |
| 0.0 | 0 |
| 0.0 | 0 |
| 0.0 | 0 |
| 0.0 | 0 |
| 0.0 | 0 |
| 0.0 | 0 |
| 0.0 | 0 |
| 0.0 | 0 |
| 0.0 | 0 |
| 0.0 | 0 |
| 0.0 | 0 |
| 0.0 | 0 |
| 0.0 | 0 |
| 0.0 | 0 |
| 0.0 | 0 |
| 0.0 | 0 |
| 0.0 | 0 |
| 0.0 | 0 |
| 0.0 | 0 |
| 0.0 | 0 |
| 0.0 | 0 |
| 0.0 | 0 |
| 0.0 | 0 |
| 0.0 | 0 |
| 0.0 | 0 |
| 0.0 | 0 |
| 0.0 | 0 |
| 0.0 | 0 |
| 0.0 | 0 |
| 0.0 | 0 |
| 0.0 | 0 |
| 0.0 | 0 |
| 0.0 | 0 |
| 0.0 | 0 |
| 0.0 | 0 |
| 0.0 | 0 |
| 0.0 | 0 |
| 0.0 | 0 |
| 0.0 | 0 |
| 0.0 | 0 |
| 0.0 | 0 |
| 0.0 | 0 |
| 0.0 | 0 |
| 0.0 | 0 |
| 0.0 | 0 |
| 0.0 | 0 |
| 0.0 | 0 |
| 0.0 | 0 |
| 0.0 | 0 |
| 0.0 | 0 |